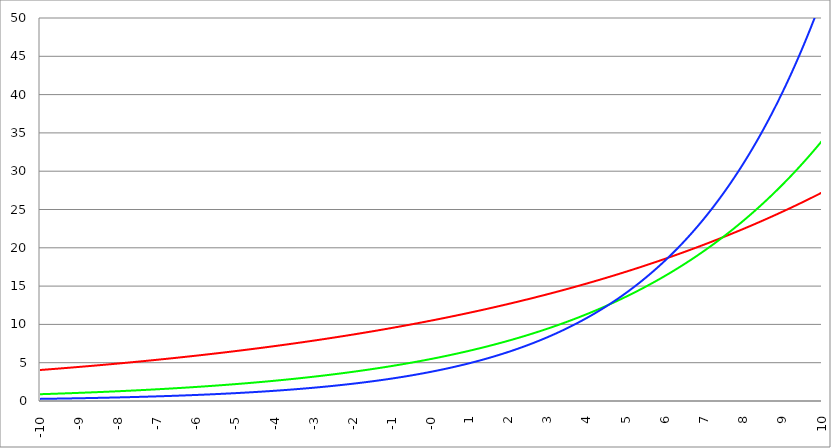
| Category | Series 1 | Series 0 | Series 2 |
|---|---|---|---|
| -10.0 | 4.045 | 0.886 | 0.276 |
| -9.99 | 4.049 | 0.887 | 0.277 |
| -9.98 | 4.053 | 0.889 | 0.278 |
| -9.97 | 4.057 | 0.891 | 0.279 |
| -9.96 | 4.061 | 0.892 | 0.279 |
| -9.95 | 4.064 | 0.894 | 0.28 |
| -9.940000000000001 | 4.068 | 0.896 | 0.281 |
| -9.930000000000001 | 4.072 | 0.897 | 0.282 |
| -9.920000000000002 | 4.076 | 0.899 | 0.282 |
| -9.91 | 4.08 | 0.9 | 0.283 |
| -9.900000000000002 | 4.084 | 0.902 | 0.284 |
| -9.890000000000002 | 4.088 | 0.904 | 0.285 |
| -9.880000000000003 | 4.092 | 0.905 | 0.285 |
| -9.870000000000003 | 4.096 | 0.907 | 0.286 |
| -9.860000000000001 | 4.099 | 0.909 | 0.287 |
| -9.850000000000003 | 4.103 | 0.91 | 0.288 |
| -9.840000000000003 | 4.107 | 0.912 | 0.288 |
| -9.830000000000004 | 4.111 | 0.914 | 0.289 |
| -9.820000000000004 | 4.115 | 0.915 | 0.29 |
| -9.810000000000004 | 4.119 | 0.917 | 0.291 |
| -9.800000000000004 | 4.123 | 0.919 | 0.291 |
| -9.790000000000004 | 4.127 | 0.92 | 0.292 |
| -9.780000000000005 | 4.131 | 0.922 | 0.293 |
| -9.770000000000005 | 4.135 | 0.924 | 0.294 |
| -9.760000000000005 | 4.139 | 0.925 | 0.294 |
| -9.750000000000005 | 4.143 | 0.927 | 0.295 |
| -9.740000000000006 | 4.147 | 0.929 | 0.296 |
| -9.730000000000006 | 4.151 | 0.931 | 0.297 |
| -9.720000000000006 | 4.155 | 0.932 | 0.298 |
| -9.710000000000006 | 4.159 | 0.934 | 0.298 |
| -9.700000000000006 | 4.162 | 0.936 | 0.299 |
| -9.690000000000007 | 4.166 | 0.937 | 0.3 |
| -9.680000000000007 | 4.17 | 0.939 | 0.301 |
| -9.670000000000007 | 4.174 | 0.941 | 0.301 |
| -9.660000000000007 | 4.178 | 0.942 | 0.302 |
| -9.650000000000007 | 4.182 | 0.944 | 0.303 |
| -9.640000000000008 | 4.186 | 0.946 | 0.304 |
| -9.630000000000008 | 4.19 | 0.948 | 0.305 |
| -9.620000000000008 | 4.194 | 0.949 | 0.305 |
| -9.610000000000008 | 4.198 | 0.951 | 0.306 |
| -9.600000000000009 | 4.202 | 0.953 | 0.307 |
| -9.590000000000009 | 4.206 | 0.955 | 0.308 |
| -9.580000000000007 | 4.21 | 0.956 | 0.309 |
| -9.57000000000001 | 4.214 | 0.958 | 0.309 |
| -9.56000000000001 | 4.218 | 0.96 | 0.31 |
| -9.55000000000001 | 4.222 | 0.962 | 0.311 |
| -9.54000000000001 | 4.226 | 0.963 | 0.312 |
| -9.53000000000001 | 4.23 | 0.965 | 0.313 |
| -9.52000000000001 | 4.235 | 0.967 | 0.314 |
| -9.51000000000001 | 4.239 | 0.969 | 0.314 |
| -9.50000000000001 | 4.243 | 0.97 | 0.315 |
| -9.49000000000001 | 4.247 | 0.972 | 0.316 |
| -9.48000000000001 | 4.251 | 0.974 | 0.317 |
| -9.47000000000001 | 4.255 | 0.976 | 0.318 |
| -9.46000000000001 | 4.259 | 0.977 | 0.319 |
| -9.45000000000001 | 4.263 | 0.979 | 0.319 |
| -9.44000000000001 | 4.267 | 0.981 | 0.32 |
| -9.430000000000012 | 4.271 | 0.983 | 0.321 |
| -9.420000000000012 | 4.275 | 0.985 | 0.322 |
| -9.410000000000013 | 4.279 | 0.986 | 0.323 |
| -9.400000000000013 | 4.283 | 0.988 | 0.324 |
| -9.390000000000011 | 4.287 | 0.99 | 0.324 |
| -9.380000000000013 | 4.291 | 0.992 | 0.325 |
| -9.370000000000013 | 4.295 | 0.994 | 0.326 |
| -9.360000000000014 | 4.3 | 0.995 | 0.327 |
| -9.350000000000014 | 4.304 | 0.997 | 0.328 |
| -9.340000000000014 | 4.308 | 0.999 | 0.329 |
| -9.330000000000014 | 4.312 | 1.001 | 0.33 |
| -9.320000000000014 | 4.316 | 1.003 | 0.33 |
| -9.310000000000015 | 4.32 | 1.005 | 0.331 |
| -9.300000000000013 | 4.324 | 1.006 | 0.332 |
| -9.290000000000015 | 4.328 | 1.008 | 0.333 |
| -9.280000000000015 | 4.332 | 1.01 | 0.334 |
| -9.270000000000016 | 4.337 | 1.012 | 0.335 |
| -9.260000000000016 | 4.341 | 1.014 | 0.336 |
| -9.250000000000014 | 4.345 | 1.016 | 0.337 |
| -9.240000000000016 | 4.349 | 1.017 | 0.337 |
| -9.230000000000016 | 4.353 | 1.019 | 0.338 |
| -9.220000000000017 | 4.357 | 1.021 | 0.339 |
| -9.210000000000017 | 4.361 | 1.023 | 0.34 |
| -9.200000000000017 | 4.366 | 1.025 | 0.341 |
| -9.190000000000017 | 4.37 | 1.027 | 0.342 |
| -9.180000000000017 | 4.374 | 1.029 | 0.343 |
| -9.170000000000018 | 4.378 | 1.031 | 0.344 |
| -9.160000000000016 | 4.382 | 1.032 | 0.345 |
| -9.150000000000018 | 4.386 | 1.034 | 0.346 |
| -9.140000000000018 | 4.391 | 1.036 | 0.346 |
| -9.130000000000019 | 4.395 | 1.038 | 0.347 |
| -9.120000000000019 | 4.399 | 1.04 | 0.348 |
| -9.110000000000017 | 4.403 | 1.042 | 0.349 |
| -9.10000000000002 | 4.407 | 1.044 | 0.35 |
| -9.09000000000002 | 4.412 | 1.046 | 0.351 |
| -9.08000000000002 | 4.416 | 1.048 | 0.352 |
| -9.07000000000002 | 4.42 | 1.05 | 0.353 |
| -9.06000000000002 | 4.424 | 1.051 | 0.354 |
| -9.05000000000002 | 4.429 | 1.053 | 0.355 |
| -9.04000000000002 | 4.433 | 1.055 | 0.356 |
| -9.03000000000002 | 4.437 | 1.057 | 0.357 |
| -9.020000000000021 | 4.441 | 1.059 | 0.358 |
| -9.010000000000021 | 4.445 | 1.061 | 0.358 |
| -9.000000000000021 | 4.45 | 1.063 | 0.359 |
| -8.990000000000022 | 4.454 | 1.065 | 0.36 |
| -8.980000000000022 | 4.458 | 1.067 | 0.361 |
| -8.97000000000002 | 4.462 | 1.069 | 0.362 |
| -8.960000000000022 | 4.467 | 1.071 | 0.363 |
| -8.950000000000022 | 4.471 | 1.073 | 0.364 |
| -8.940000000000023 | 4.475 | 1.075 | 0.365 |
| -8.930000000000023 | 4.479 | 1.077 | 0.366 |
| -8.920000000000023 | 4.484 | 1.079 | 0.367 |
| -8.910000000000023 | 4.488 | 1.081 | 0.368 |
| -8.900000000000023 | 4.492 | 1.083 | 0.369 |
| -8.890000000000024 | 4.497 | 1.085 | 0.37 |
| -8.880000000000024 | 4.501 | 1.087 | 0.371 |
| -8.870000000000024 | 4.505 | 1.088 | 0.372 |
| -8.860000000000024 | 4.509 | 1.09 | 0.373 |
| -8.850000000000025 | 4.514 | 1.092 | 0.374 |
| -8.840000000000025 | 4.518 | 1.094 | 0.375 |
| -8.830000000000025 | 4.522 | 1.096 | 0.376 |
| -8.820000000000025 | 4.527 | 1.098 | 0.377 |
| -8.810000000000025 | 4.531 | 1.1 | 0.378 |
| -8.800000000000026 | 4.535 | 1.102 | 0.379 |
| -8.790000000000026 | 4.54 | 1.104 | 0.38 |
| -8.780000000000026 | 4.544 | 1.106 | 0.381 |
| -8.770000000000026 | 4.548 | 1.109 | 0.382 |
| -8.760000000000026 | 4.553 | 1.111 | 0.383 |
| -8.750000000000027 | 4.557 | 1.113 | 0.384 |
| -8.740000000000027 | 4.561 | 1.115 | 0.385 |
| -8.730000000000027 | 4.566 | 1.117 | 0.386 |
| -8.720000000000027 | 4.57 | 1.119 | 0.387 |
| -8.710000000000027 | 4.574 | 1.121 | 0.388 |
| -8.700000000000028 | 4.579 | 1.123 | 0.389 |
| -8.690000000000028 | 4.583 | 1.125 | 0.39 |
| -8.680000000000028 | 4.587 | 1.127 | 0.391 |
| -8.670000000000028 | 4.592 | 1.129 | 0.392 |
| -8.660000000000029 | 4.596 | 1.131 | 0.393 |
| -8.650000000000029 | 4.601 | 1.133 | 0.394 |
| -8.640000000000029 | 4.605 | 1.135 | 0.395 |
| -8.63000000000003 | 4.609 | 1.137 | 0.396 |
| -8.62000000000003 | 4.614 | 1.139 | 0.397 |
| -8.61000000000003 | 4.618 | 1.141 | 0.398 |
| -8.60000000000003 | 4.623 | 1.143 | 0.399 |
| -8.59000000000003 | 4.627 | 1.145 | 0.4 |
| -8.58000000000003 | 4.631 | 1.148 | 0.401 |
| -8.57000000000003 | 4.636 | 1.15 | 0.402 |
| -8.56000000000003 | 4.64 | 1.152 | 0.403 |
| -8.55000000000003 | 4.645 | 1.154 | 0.404 |
| -8.540000000000031 | 4.649 | 1.156 | 0.406 |
| -8.530000000000031 | 4.654 | 1.158 | 0.407 |
| -8.520000000000032 | 4.658 | 1.16 | 0.408 |
| -8.510000000000032 | 4.662 | 1.162 | 0.409 |
| -8.50000000000003 | 4.667 | 1.164 | 0.41 |
| -8.490000000000032 | 4.671 | 1.167 | 0.411 |
| -8.480000000000032 | 4.676 | 1.169 | 0.412 |
| -8.470000000000033 | 4.68 | 1.171 | 0.413 |
| -8.460000000000033 | 4.685 | 1.173 | 0.414 |
| -8.450000000000033 | 4.689 | 1.175 | 0.415 |
| -8.440000000000033 | 4.694 | 1.177 | 0.416 |
| -8.430000000000033 | 4.698 | 1.179 | 0.417 |
| -8.420000000000034 | 4.703 | 1.182 | 0.418 |
| -8.410000000000032 | 4.707 | 1.184 | 0.42 |
| -8.400000000000034 | 4.712 | 1.186 | 0.421 |
| -8.390000000000034 | 4.716 | 1.188 | 0.422 |
| -8.380000000000035 | 4.721 | 1.19 | 0.423 |
| -8.370000000000035 | 4.725 | 1.192 | 0.424 |
| -8.360000000000033 | 4.73 | 1.195 | 0.425 |
| -8.350000000000035 | 4.734 | 1.197 | 0.426 |
| -8.340000000000035 | 4.739 | 1.199 | 0.427 |
| -8.330000000000036 | 4.743 | 1.201 | 0.428 |
| -8.320000000000036 | 4.748 | 1.203 | 0.43 |
| -8.310000000000034 | 4.752 | 1.205 | 0.431 |
| -8.300000000000036 | 4.757 | 1.208 | 0.432 |
| -8.290000000000036 | 4.761 | 1.21 | 0.433 |
| -8.280000000000037 | 4.766 | 1.212 | 0.434 |
| -8.270000000000037 | 4.77 | 1.214 | 0.435 |
| -8.260000000000037 | 4.775 | 1.217 | 0.436 |
| -8.250000000000037 | 4.779 | 1.219 | 0.438 |
| -8.240000000000038 | 4.784 | 1.221 | 0.439 |
| -8.230000000000038 | 4.788 | 1.223 | 0.44 |
| -8.220000000000038 | 4.793 | 1.225 | 0.441 |
| -8.210000000000038 | 4.798 | 1.228 | 0.442 |
| -8.200000000000038 | 4.802 | 1.23 | 0.443 |
| -8.190000000000039 | 4.807 | 1.232 | 0.445 |
| -8.180000000000039 | 4.811 | 1.234 | 0.446 |
| -8.170000000000037 | 4.816 | 1.237 | 0.447 |
| -8.16000000000004 | 4.821 | 1.239 | 0.448 |
| -8.15000000000004 | 4.825 | 1.241 | 0.449 |
| -8.14000000000004 | 4.83 | 1.243 | 0.45 |
| -8.13000000000004 | 4.834 | 1.246 | 0.452 |
| -8.12000000000004 | 4.839 | 1.248 | 0.453 |
| -8.11000000000004 | 4.844 | 1.25 | 0.454 |
| -8.10000000000004 | 4.848 | 1.253 | 0.455 |
| -8.09000000000004 | 4.853 | 1.255 | 0.456 |
| -8.08000000000004 | 4.857 | 1.257 | 0.458 |
| -8.07000000000004 | 4.862 | 1.259 | 0.459 |
| -8.06000000000004 | 4.867 | 1.262 | 0.46 |
| -8.05000000000004 | 4.871 | 1.264 | 0.461 |
| -8.040000000000042 | 4.876 | 1.266 | 0.462 |
| -8.03000000000004 | 4.881 | 1.269 | 0.464 |
| -8.020000000000042 | 4.885 | 1.271 | 0.465 |
| -8.010000000000042 | 4.89 | 1.273 | 0.466 |
| -8.000000000000043 | 4.895 | 1.276 | 0.467 |
| -7.990000000000043 | 4.899 | 1.278 | 0.468 |
| -7.980000000000043 | 4.904 | 1.28 | 0.47 |
| -7.970000000000043 | 4.909 | 1.283 | 0.471 |
| -7.960000000000043 | 4.913 | 1.285 | 0.472 |
| -7.950000000000044 | 4.918 | 1.287 | 0.473 |
| -7.940000000000044 | 4.923 | 1.29 | 0.475 |
| -7.930000000000044 | 4.927 | 1.292 | 0.476 |
| -7.920000000000044 | 4.932 | 1.294 | 0.477 |
| -7.910000000000044 | 4.937 | 1.297 | 0.478 |
| -7.900000000000044 | 4.941 | 1.299 | 0.48 |
| -7.890000000000045 | 4.946 | 1.301 | 0.481 |
| -7.880000000000045 | 4.951 | 1.304 | 0.482 |
| -7.870000000000045 | 4.956 | 1.306 | 0.483 |
| -7.860000000000046 | 4.96 | 1.309 | 0.485 |
| -7.850000000000046 | 4.965 | 1.311 | 0.486 |
| -7.840000000000046 | 4.97 | 1.313 | 0.487 |
| -7.830000000000046 | 4.975 | 1.316 | 0.489 |
| -7.820000000000046 | 4.979 | 1.318 | 0.49 |
| -7.810000000000047 | 4.984 | 1.321 | 0.491 |
| -7.800000000000047 | 4.989 | 1.323 | 0.492 |
| -7.790000000000047 | 4.994 | 1.325 | 0.494 |
| -7.780000000000047 | 4.998 | 1.328 | 0.495 |
| -7.770000000000047 | 5.003 | 1.33 | 0.496 |
| -7.760000000000048 | 5.008 | 1.333 | 0.498 |
| -7.750000000000048 | 5.013 | 1.335 | 0.499 |
| -7.740000000000048 | 5.017 | 1.338 | 0.5 |
| -7.730000000000048 | 5.022 | 1.34 | 0.502 |
| -7.720000000000049 | 5.027 | 1.342 | 0.503 |
| -7.710000000000049 | 5.032 | 1.345 | 0.504 |
| -7.700000000000049 | 5.037 | 1.347 | 0.506 |
| -7.690000000000049 | 5.041 | 1.35 | 0.507 |
| -7.680000000000049 | 5.046 | 1.352 | 0.508 |
| -7.67000000000005 | 5.051 | 1.355 | 0.51 |
| -7.66000000000005 | 5.056 | 1.357 | 0.511 |
| -7.65000000000005 | 5.061 | 1.36 | 0.512 |
| -7.64000000000005 | 5.065 | 1.362 | 0.514 |
| -7.63000000000005 | 5.07 | 1.365 | 0.515 |
| -7.620000000000051 | 5.075 | 1.367 | 0.516 |
| -7.610000000000051 | 5.08 | 1.37 | 0.518 |
| -7.600000000000051 | 5.085 | 1.372 | 0.519 |
| -7.590000000000051 | 5.09 | 1.375 | 0.52 |
| -7.580000000000052 | 5.095 | 1.377 | 0.522 |
| -7.570000000000052 | 5.099 | 1.38 | 0.523 |
| -7.560000000000052 | 5.104 | 1.382 | 0.524 |
| -7.550000000000052 | 5.109 | 1.385 | 0.526 |
| -7.540000000000052 | 5.114 | 1.387 | 0.527 |
| -7.530000000000053 | 5.119 | 1.39 | 0.529 |
| -7.520000000000053 | 5.124 | 1.392 | 0.53 |
| -7.510000000000053 | 5.129 | 1.395 | 0.531 |
| -7.500000000000053 | 5.134 | 1.397 | 0.533 |
| -7.490000000000053 | 5.138 | 1.4 | 0.534 |
| -7.480000000000054 | 5.143 | 1.402 | 0.536 |
| -7.470000000000054 | 5.148 | 1.405 | 0.537 |
| -7.460000000000054 | 5.153 | 1.408 | 0.538 |
| -7.450000000000054 | 5.158 | 1.41 | 0.54 |
| -7.440000000000054 | 5.163 | 1.413 | 0.541 |
| -7.430000000000054 | 5.168 | 1.415 | 0.543 |
| -7.420000000000055 | 5.173 | 1.418 | 0.544 |
| -7.410000000000055 | 5.178 | 1.42 | 0.545 |
| -7.400000000000055 | 5.183 | 1.423 | 0.547 |
| -7.390000000000056 | 5.188 | 1.426 | 0.548 |
| -7.380000000000056 | 5.193 | 1.428 | 0.55 |
| -7.370000000000056 | 5.198 | 1.431 | 0.551 |
| -7.360000000000056 | 5.202 | 1.433 | 0.553 |
| -7.350000000000056 | 5.207 | 1.436 | 0.554 |
| -7.340000000000057 | 5.212 | 1.439 | 0.556 |
| -7.330000000000057 | 5.217 | 1.441 | 0.557 |
| -7.320000000000057 | 5.222 | 1.444 | 0.559 |
| -7.310000000000057 | 5.227 | 1.447 | 0.56 |
| -7.300000000000058 | 5.232 | 1.449 | 0.561 |
| -7.290000000000058 | 5.237 | 1.452 | 0.563 |
| -7.280000000000058 | 5.242 | 1.455 | 0.564 |
| -7.270000000000058 | 5.247 | 1.457 | 0.566 |
| -7.260000000000058 | 5.252 | 1.46 | 0.567 |
| -7.250000000000059 | 5.257 | 1.463 | 0.569 |
| -7.240000000000059 | 5.262 | 1.465 | 0.57 |
| -7.23000000000006 | 5.267 | 1.468 | 0.572 |
| -7.220000000000059 | 5.272 | 1.471 | 0.573 |
| -7.210000000000059 | 5.277 | 1.473 | 0.575 |
| -7.20000000000006 | 5.282 | 1.476 | 0.576 |
| -7.19000000000006 | 5.287 | 1.479 | 0.578 |
| -7.18000000000006 | 5.293 | 1.481 | 0.579 |
| -7.17000000000006 | 5.298 | 1.484 | 0.581 |
| -7.160000000000061 | 5.303 | 1.487 | 0.582 |
| -7.150000000000061 | 5.308 | 1.489 | 0.584 |
| -7.140000000000061 | 5.313 | 1.492 | 0.586 |
| -7.130000000000061 | 5.318 | 1.495 | 0.587 |
| -7.120000000000061 | 5.323 | 1.498 | 0.589 |
| -7.110000000000062 | 5.328 | 1.5 | 0.59 |
| -7.100000000000062 | 5.333 | 1.503 | 0.592 |
| -7.090000000000062 | 5.338 | 1.506 | 0.593 |
| -7.080000000000062 | 5.343 | 1.509 | 0.595 |
| -7.070000000000062 | 5.348 | 1.511 | 0.596 |
| -7.060000000000063 | 5.353 | 1.514 | 0.598 |
| -7.050000000000063 | 5.358 | 1.517 | 0.6 |
| -7.040000000000063 | 5.364 | 1.52 | 0.601 |
| -7.030000000000063 | 5.369 | 1.522 | 0.603 |
| -7.020000000000064 | 5.374 | 1.525 | 0.604 |
| -7.010000000000064 | 5.379 | 1.528 | 0.606 |
| -7.000000000000064 | 5.384 | 1.531 | 0.607 |
| -6.990000000000064 | 5.389 | 1.534 | 0.609 |
| -6.980000000000064 | 5.394 | 1.536 | 0.611 |
| -6.970000000000064 | 5.4 | 1.539 | 0.612 |
| -6.960000000000064 | 5.405 | 1.542 | 0.614 |
| -6.950000000000064 | 5.41 | 1.545 | 0.615 |
| -6.940000000000065 | 5.415 | 1.548 | 0.617 |
| -6.930000000000065 | 5.42 | 1.55 | 0.619 |
| -6.920000000000065 | 5.425 | 1.553 | 0.62 |
| -6.910000000000065 | 5.43 | 1.556 | 0.622 |
| -6.900000000000066 | 5.436 | 1.559 | 0.624 |
| -6.890000000000066 | 5.441 | 1.562 | 0.625 |
| -6.880000000000066 | 5.446 | 1.565 | 0.627 |
| -6.870000000000066 | 5.451 | 1.567 | 0.628 |
| -6.860000000000067 | 5.456 | 1.57 | 0.63 |
| -6.850000000000067 | 5.462 | 1.573 | 0.632 |
| -6.840000000000067 | 5.467 | 1.576 | 0.633 |
| -6.830000000000067 | 5.472 | 1.579 | 0.635 |
| -6.820000000000068 | 5.477 | 1.582 | 0.637 |
| -6.810000000000068 | 5.482 | 1.585 | 0.638 |
| -6.800000000000068 | 5.488 | 1.588 | 0.64 |
| -6.790000000000068 | 5.493 | 1.59 | 0.642 |
| -6.780000000000068 | 5.498 | 1.593 | 0.644 |
| -6.770000000000068 | 5.503 | 1.596 | 0.645 |
| -6.760000000000069 | 5.509 | 1.599 | 0.647 |
| -6.75000000000007 | 5.514 | 1.602 | 0.649 |
| -6.74000000000007 | 5.519 | 1.605 | 0.65 |
| -6.73000000000007 | 5.524 | 1.608 | 0.652 |
| -6.72000000000007 | 5.53 | 1.611 | 0.654 |
| -6.71000000000007 | 5.535 | 1.614 | 0.655 |
| -6.70000000000007 | 5.54 | 1.617 | 0.657 |
| -6.69000000000007 | 5.546 | 1.62 | 0.659 |
| -6.680000000000071 | 5.551 | 1.623 | 0.661 |
| -6.670000000000071 | 5.556 | 1.626 | 0.662 |
| -6.660000000000071 | 5.561 | 1.629 | 0.664 |
| -6.650000000000071 | 5.567 | 1.632 | 0.666 |
| -6.640000000000072 | 5.572 | 1.635 | 0.668 |
| -6.630000000000072 | 5.577 | 1.638 | 0.669 |
| -6.620000000000072 | 5.583 | 1.641 | 0.671 |
| -6.610000000000072 | 5.588 | 1.644 | 0.673 |
| -6.600000000000072 | 5.593 | 1.647 | 0.675 |
| -6.590000000000073 | 5.599 | 1.65 | 0.676 |
| -6.580000000000073 | 5.604 | 1.653 | 0.678 |
| -6.570000000000073 | 5.609 | 1.656 | 0.68 |
| -6.560000000000073 | 5.615 | 1.659 | 0.682 |
| -6.550000000000074 | 5.62 | 1.662 | 0.684 |
| -6.540000000000074 | 5.625 | 1.665 | 0.685 |
| -6.530000000000074 | 5.631 | 1.668 | 0.687 |
| -6.520000000000074 | 5.636 | 1.671 | 0.689 |
| -6.510000000000074 | 5.641 | 1.674 | 0.691 |
| -6.500000000000074 | 5.647 | 1.677 | 0.693 |
| -6.490000000000074 | 5.652 | 1.68 | 0.694 |
| -6.480000000000074 | 5.658 | 1.683 | 0.696 |
| -6.470000000000075 | 5.663 | 1.686 | 0.698 |
| -6.460000000000075 | 5.668 | 1.689 | 0.7 |
| -6.450000000000075 | 5.674 | 1.692 | 0.702 |
| -6.440000000000075 | 5.679 | 1.695 | 0.704 |
| -6.430000000000076 | 5.685 | 1.698 | 0.705 |
| -6.420000000000076 | 5.69 | 1.701 | 0.707 |
| -6.410000000000076 | 5.696 | 1.705 | 0.709 |
| -6.400000000000076 | 5.701 | 1.708 | 0.711 |
| -6.390000000000077 | 5.706 | 1.711 | 0.713 |
| -6.380000000000077 | 5.712 | 1.714 | 0.715 |
| -6.370000000000077 | 5.717 | 1.717 | 0.717 |
| -6.360000000000078 | 5.723 | 1.72 | 0.718 |
| -6.350000000000078 | 5.728 | 1.723 | 0.72 |
| -6.340000000000078 | 5.734 | 1.726 | 0.722 |
| -6.330000000000078 | 5.739 | 1.73 | 0.724 |
| -6.320000000000078 | 5.745 | 1.733 | 0.726 |
| -6.310000000000079 | 5.75 | 1.736 | 0.728 |
| -6.300000000000079 | 5.756 | 1.739 | 0.73 |
| -6.29000000000008 | 5.761 | 1.742 | 0.732 |
| -6.28000000000008 | 5.767 | 1.745 | 0.734 |
| -6.27000000000008 | 5.772 | 1.749 | 0.736 |
| -6.26000000000008 | 5.778 | 1.752 | 0.738 |
| -6.25000000000008 | 5.783 | 1.755 | 0.74 |
| -6.24000000000008 | 5.789 | 1.758 | 0.741 |
| -6.23000000000008 | 5.794 | 1.761 | 0.743 |
| -6.220000000000081 | 5.8 | 1.765 | 0.745 |
| -6.210000000000081 | 5.805 | 1.768 | 0.747 |
| -6.200000000000081 | 5.811 | 1.771 | 0.749 |
| -6.190000000000081 | 5.816 | 1.774 | 0.751 |
| -6.180000000000081 | 5.822 | 1.778 | 0.753 |
| -6.170000000000082 | 5.827 | 1.781 | 0.755 |
| -6.160000000000082 | 5.833 | 1.784 | 0.757 |
| -6.150000000000082 | 5.838 | 1.787 | 0.759 |
| -6.140000000000082 | 5.844 | 1.791 | 0.761 |
| -6.130000000000082 | 5.85 | 1.794 | 0.763 |
| -6.120000000000083 | 5.855 | 1.797 | 0.765 |
| -6.110000000000083 | 5.861 | 1.8 | 0.767 |
| -6.100000000000083 | 5.866 | 1.804 | 0.769 |
| -6.090000000000083 | 5.872 | 1.807 | 0.771 |
| -6.080000000000084 | 5.878 | 1.81 | 0.773 |
| -6.070000000000084 | 5.883 | 1.814 | 0.775 |
| -6.060000000000084 | 5.889 | 1.817 | 0.777 |
| -6.050000000000084 | 5.894 | 1.82 | 0.779 |
| -6.040000000000084 | 5.9 | 1.824 | 0.781 |
| -6.030000000000084 | 5.906 | 1.827 | 0.783 |
| -6.020000000000085 | 5.911 | 1.83 | 0.786 |
| -6.010000000000085 | 5.917 | 1.834 | 0.788 |
| -6.000000000000085 | 5.922 | 1.837 | 0.79 |
| -5.990000000000085 | 5.928 | 1.84 | 0.792 |
| -5.980000000000085 | 5.934 | 1.844 | 0.794 |
| -5.970000000000085 | 5.939 | 1.847 | 0.796 |
| -5.960000000000086 | 5.945 | 1.85 | 0.798 |
| -5.950000000000086 | 5.951 | 1.854 | 0.8 |
| -5.940000000000086 | 5.956 | 1.857 | 0.802 |
| -5.930000000000086 | 5.962 | 1.86 | 0.804 |
| -5.920000000000087 | 5.968 | 1.864 | 0.806 |
| -5.910000000000087 | 5.974 | 1.867 | 0.809 |
| -5.900000000000087 | 5.979 | 1.871 | 0.811 |
| -5.890000000000088 | 5.985 | 1.874 | 0.813 |
| -5.880000000000088 | 5.991 | 1.877 | 0.815 |
| -5.870000000000088 | 5.996 | 1.881 | 0.817 |
| -5.860000000000088 | 6.002 | 1.884 | 0.819 |
| -5.850000000000088 | 6.008 | 1.888 | 0.821 |
| -5.840000000000089 | 6.014 | 1.891 | 0.824 |
| -5.830000000000089 | 6.019 | 1.895 | 0.826 |
| -5.820000000000089 | 6.025 | 1.898 | 0.828 |
| -5.810000000000089 | 6.031 | 1.902 | 0.83 |
| -5.800000000000089 | 6.036 | 1.905 | 0.832 |
| -5.79000000000009 | 6.042 | 1.909 | 0.834 |
| -5.78000000000009 | 6.048 | 1.912 | 0.837 |
| -5.77000000000009 | 6.054 | 1.916 | 0.839 |
| -5.76000000000009 | 6.06 | 1.919 | 0.841 |
| -5.750000000000091 | 6.065 | 1.923 | 0.843 |
| -5.740000000000091 | 6.071 | 1.926 | 0.845 |
| -5.730000000000091 | 6.077 | 1.93 | 0.848 |
| -5.720000000000091 | 6.083 | 1.933 | 0.85 |
| -5.710000000000091 | 6.088 | 1.937 | 0.852 |
| -5.700000000000092 | 6.094 | 1.94 | 0.854 |
| -5.690000000000092 | 6.1 | 1.944 | 0.857 |
| -5.680000000000092 | 6.106 | 1.947 | 0.859 |
| -5.670000000000092 | 6.112 | 1.951 | 0.861 |
| -5.660000000000092 | 6.118 | 1.954 | 0.863 |
| -5.650000000000093 | 6.123 | 1.958 | 0.866 |
| -5.640000000000093 | 6.129 | 1.961 | 0.868 |
| -5.630000000000093 | 6.135 | 1.965 | 0.87 |
| -5.620000000000093 | 6.141 | 1.969 | 0.872 |
| -5.610000000000093 | 6.147 | 1.972 | 0.875 |
| -5.600000000000094 | 6.153 | 1.976 | 0.877 |
| -5.590000000000094 | 6.159 | 1.979 | 0.879 |
| -5.580000000000094 | 6.164 | 1.983 | 0.882 |
| -5.570000000000094 | 6.17 | 1.987 | 0.884 |
| -5.560000000000095 | 6.176 | 1.99 | 0.886 |
| -5.550000000000095 | 6.182 | 1.994 | 0.889 |
| -5.540000000000095 | 6.188 | 1.998 | 0.891 |
| -5.530000000000095 | 6.194 | 2.001 | 0.893 |
| -5.520000000000095 | 6.2 | 2.005 | 0.896 |
| -5.510000000000096 | 6.206 | 2.009 | 0.898 |
| -5.500000000000096 | 6.212 | 2.012 | 0.9 |
| -5.490000000000096 | 6.217 | 2.016 | 0.903 |
| -5.480000000000096 | 6.223 | 2.02 | 0.905 |
| -5.470000000000096 | 6.229 | 2.023 | 0.907 |
| -5.460000000000097 | 6.235 | 2.027 | 0.91 |
| -5.450000000000097 | 6.241 | 2.031 | 0.912 |
| -5.440000000000097 | 6.247 | 2.034 | 0.915 |
| -5.430000000000097 | 6.253 | 2.038 | 0.917 |
| -5.420000000000098 | 6.259 | 2.042 | 0.919 |
| -5.410000000000098 | 6.265 | 2.045 | 0.922 |
| -5.400000000000098 | 6.271 | 2.049 | 0.924 |
| -5.390000000000098 | 6.277 | 2.053 | 0.927 |
| -5.380000000000098 | 6.283 | 2.057 | 0.929 |
| -5.370000000000099 | 6.289 | 2.06 | 0.932 |
| -5.360000000000099 | 6.295 | 2.064 | 0.934 |
| -5.350000000000099 | 6.301 | 2.068 | 0.936 |
| -5.340000000000099 | 6.307 | 2.072 | 0.939 |
| -5.330000000000099 | 6.313 | 2.076 | 0.941 |
| -5.3200000000001 | 6.319 | 2.079 | 0.944 |
| -5.3100000000001 | 6.325 | 2.083 | 0.946 |
| -5.3000000000001 | 6.331 | 2.087 | 0.949 |
| -5.2900000000001 | 6.337 | 2.091 | 0.951 |
| -5.2800000000001 | 6.343 | 2.095 | 0.954 |
| -5.2700000000001 | 6.349 | 2.098 | 0.956 |
| -5.260000000000101 | 6.355 | 2.102 | 0.959 |
| -5.250000000000101 | 6.361 | 2.106 | 0.961 |
| -5.240000000000101 | 6.367 | 2.11 | 0.964 |
| -5.230000000000101 | 6.373 | 2.114 | 0.966 |
| -5.220000000000102 | 6.38 | 2.118 | 0.969 |
| -5.210000000000102 | 6.386 | 2.121 | 0.972 |
| -5.200000000000102 | 6.392 | 2.125 | 0.974 |
| -5.190000000000103 | 6.398 | 2.129 | 0.977 |
| -5.180000000000103 | 6.404 | 2.133 | 0.979 |
| -5.170000000000103 | 6.41 | 2.137 | 0.982 |
| -5.160000000000103 | 6.416 | 2.141 | 0.984 |
| -5.150000000000103 | 6.422 | 2.145 | 0.987 |
| -5.140000000000104 | 6.428 | 2.149 | 0.99 |
| -5.130000000000104 | 6.435 | 2.153 | 0.992 |
| -5.120000000000104 | 6.441 | 2.157 | 0.995 |
| -5.110000000000104 | 6.447 | 2.16 | 0.997 |
| -5.100000000000104 | 6.453 | 2.164 | 1 |
| -5.090000000000104 | 6.459 | 2.168 | 1.003 |
| -5.080000000000104 | 6.465 | 2.172 | 1.005 |
| -5.070000000000105 | 6.471 | 2.176 | 1.008 |
| -5.060000000000105 | 6.478 | 2.18 | 1.011 |
| -5.050000000000105 | 6.484 | 2.184 | 1.013 |
| -5.040000000000105 | 6.49 | 2.188 | 1.016 |
| -5.030000000000105 | 6.496 | 2.192 | 1.018 |
| -5.020000000000106 | 6.502 | 2.196 | 1.021 |
| -5.010000000000106 | 6.509 | 2.2 | 1.024 |
| -5.000000000000106 | 6.515 | 2.204 | 1.027 |
| -4.990000000000106 | 6.521 | 2.208 | 1.029 |
| -4.980000000000106 | 6.527 | 2.212 | 1.032 |
| -4.970000000000107 | 6.533 | 2.216 | 1.035 |
| -4.960000000000107 | 6.54 | 2.22 | 1.037 |
| -4.950000000000107 | 6.546 | 2.224 | 1.04 |
| -4.940000000000107 | 6.552 | 2.228 | 1.043 |
| -4.930000000000108 | 6.558 | 2.233 | 1.046 |
| -4.920000000000108 | 6.565 | 2.237 | 1.048 |
| -4.910000000000108 | 6.571 | 2.241 | 1.051 |
| -4.900000000000108 | 6.577 | 2.245 | 1.054 |
| -4.890000000000109 | 6.583 | 2.249 | 1.057 |
| -4.88000000000011 | 6.59 | 2.253 | 1.059 |
| -4.87000000000011 | 6.596 | 2.257 | 1.062 |
| -4.86000000000011 | 6.602 | 2.261 | 1.065 |
| -4.85000000000011 | 6.609 | 2.265 | 1.068 |
| -4.84000000000011 | 6.615 | 2.269 | 1.071 |
| -4.83000000000011 | 6.621 | 2.274 | 1.073 |
| -4.82000000000011 | 6.627 | 2.278 | 1.076 |
| -4.810000000000111 | 6.634 | 2.282 | 1.079 |
| -4.800000000000111 | 6.64 | 2.286 | 1.082 |
| -4.790000000000111 | 6.646 | 2.29 | 1.085 |
| -4.780000000000111 | 6.653 | 2.294 | 1.088 |
| -4.770000000000111 | 6.659 | 2.299 | 1.09 |
| -4.760000000000112 | 6.665 | 2.303 | 1.093 |
| -4.750000000000112 | 6.672 | 2.307 | 1.096 |
| -4.740000000000112 | 6.678 | 2.311 | 1.099 |
| -4.730000000000112 | 6.685 | 2.315 | 1.102 |
| -4.720000000000112 | 6.691 | 2.32 | 1.105 |
| -4.710000000000113 | 6.697 | 2.324 | 1.108 |
| -4.700000000000113 | 6.704 | 2.328 | 1.111 |
| -4.690000000000113 | 6.71 | 2.332 | 1.114 |
| -4.680000000000113 | 6.716 | 2.337 | 1.116 |
| -4.670000000000114 | 6.723 | 2.341 | 1.119 |
| -4.660000000000114 | 6.729 | 2.345 | 1.122 |
| -4.650000000000114 | 6.736 | 2.349 | 1.125 |
| -4.640000000000114 | 6.742 | 2.354 | 1.128 |
| -4.630000000000114 | 6.749 | 2.358 | 1.131 |
| -4.620000000000115 | 6.755 | 2.362 | 1.134 |
| -4.610000000000115 | 6.761 | 2.367 | 1.137 |
| -4.600000000000115 | 6.768 | 2.371 | 1.14 |
| -4.590000000000115 | 6.774 | 2.375 | 1.143 |
| -4.580000000000115 | 6.781 | 2.38 | 1.146 |
| -4.570000000000115 | 6.787 | 2.384 | 1.149 |
| -4.560000000000116 | 6.794 | 2.388 | 1.152 |
| -4.550000000000116 | 6.8 | 2.393 | 1.155 |
| -4.540000000000116 | 6.807 | 2.397 | 1.158 |
| -4.530000000000116 | 6.813 | 2.401 | 1.161 |
| -4.520000000000117 | 6.82 | 2.406 | 1.164 |
| -4.510000000000117 | 6.826 | 2.41 | 1.167 |
| -4.500000000000117 | 6.833 | 2.415 | 1.17 |
| -4.490000000000117 | 6.839 | 2.419 | 1.174 |
| -4.480000000000117 | 6.846 | 2.423 | 1.177 |
| -4.470000000000117 | 6.852 | 2.428 | 1.18 |
| -4.460000000000118 | 6.859 | 2.432 | 1.183 |
| -4.450000000000118 | 6.865 | 2.437 | 1.186 |
| -4.440000000000118 | 6.872 | 2.441 | 1.189 |
| -4.430000000000118 | 6.878 | 2.446 | 1.192 |
| -4.420000000000119 | 6.885 | 2.45 | 1.195 |
| -4.41000000000012 | 6.892 | 2.455 | 1.198 |
| -4.40000000000012 | 6.898 | 2.459 | 1.202 |
| -4.39000000000012 | 6.905 | 2.464 | 1.205 |
| -4.38000000000012 | 6.911 | 2.468 | 1.208 |
| -4.37000000000012 | 6.918 | 2.473 | 1.211 |
| -4.36000000000012 | 6.925 | 2.477 | 1.214 |
| -4.35000000000012 | 6.931 | 2.482 | 1.217 |
| -4.34000000000012 | 6.938 | 2.486 | 1.221 |
| -4.33000000000012 | 6.944 | 2.491 | 1.224 |
| -4.320000000000121 | 6.951 | 2.495 | 1.227 |
| -4.310000000000121 | 6.958 | 2.5 | 1.23 |
| -4.300000000000121 | 6.964 | 2.504 | 1.233 |
| -4.290000000000121 | 6.971 | 2.509 | 1.237 |
| -4.280000000000121 | 6.978 | 2.513 | 1.24 |
| -4.270000000000122 | 6.984 | 2.518 | 1.243 |
| -4.260000000000122 | 6.991 | 2.523 | 1.247 |
| -4.250000000000122 | 6.997 | 2.527 | 1.25 |
| -4.240000000000122 | 7.004 | 2.532 | 1.253 |
| -4.230000000000122 | 7.011 | 2.536 | 1.256 |
| -4.220000000000123 | 7.018 | 2.541 | 1.26 |
| -4.210000000000123 | 7.024 | 2.546 | 1.263 |
| -4.200000000000123 | 7.031 | 2.55 | 1.266 |
| -4.190000000000124 | 7.038 | 2.555 | 1.27 |
| -4.180000000000124 | 7.044 | 2.56 | 1.273 |
| -4.170000000000124 | 7.051 | 2.564 | 1.276 |
| -4.160000000000124 | 7.058 | 2.569 | 1.28 |
| -4.150000000000124 | 7.064 | 2.574 | 1.283 |
| -4.140000000000124 | 7.071 | 2.578 | 1.286 |
| -4.130000000000125 | 7.078 | 2.583 | 1.29 |
| -4.120000000000125 | 7.085 | 2.588 | 1.293 |
| -4.110000000000125 | 7.091 | 2.593 | 1.297 |
| -4.100000000000125 | 7.098 | 2.597 | 1.3 |
| -4.090000000000125 | 7.105 | 2.602 | 1.303 |
| -4.080000000000126 | 7.112 | 2.607 | 1.307 |
| -4.070000000000126 | 7.119 | 2.612 | 1.31 |
| -4.060000000000126 | 7.125 | 2.616 | 1.314 |
| -4.050000000000126 | 7.132 | 2.621 | 1.317 |
| -4.040000000000127 | 7.139 | 2.626 | 1.321 |
| -4.030000000000127 | 7.146 | 2.631 | 1.324 |
| -4.020000000000127 | 7.153 | 2.635 | 1.328 |
| -4.010000000000127 | 7.159 | 2.64 | 1.331 |
| -4.000000000000127 | 7.166 | 2.645 | 1.335 |
| -3.990000000000128 | 7.173 | 2.65 | 1.338 |
| -3.980000000000128 | 7.18 | 2.655 | 1.342 |
| -3.970000000000129 | 7.187 | 2.66 | 1.345 |
| -3.960000000000129 | 7.194 | 2.664 | 1.349 |
| -3.950000000000129 | 7.2 | 2.669 | 1.352 |
| -3.940000000000129 | 7.207 | 2.674 | 1.356 |
| -3.930000000000129 | 7.214 | 2.679 | 1.359 |
| -3.92000000000013 | 7.221 | 2.684 | 1.363 |
| -3.91000000000013 | 7.228 | 2.689 | 1.366 |
| -3.90000000000013 | 7.235 | 2.694 | 1.37 |
| -3.89000000000013 | 7.242 | 2.699 | 1.374 |
| -3.88000000000013 | 7.249 | 2.704 | 1.377 |
| -3.870000000000131 | 7.256 | 2.709 | 1.381 |
| -3.860000000000131 | 7.262 | 2.713 | 1.384 |
| -3.850000000000131 | 7.269 | 2.718 | 1.388 |
| -3.840000000000131 | 7.276 | 2.723 | 1.392 |
| -3.830000000000131 | 7.283 | 2.728 | 1.395 |
| -3.820000000000132 | 7.29 | 2.733 | 1.399 |
| -3.810000000000132 | 7.297 | 2.738 | 1.403 |
| -3.800000000000132 | 7.304 | 2.743 | 1.406 |
| -3.790000000000132 | 7.311 | 2.748 | 1.41 |
| -3.780000000000132 | 7.318 | 2.753 | 1.414 |
| -3.770000000000133 | 7.325 | 2.758 | 1.418 |
| -3.760000000000133 | 7.332 | 2.763 | 1.421 |
| -3.750000000000133 | 7.339 | 2.768 | 1.425 |
| -3.740000000000133 | 7.346 | 2.773 | 1.429 |
| -3.730000000000134 | 7.353 | 2.779 | 1.432 |
| -3.720000000000134 | 7.36 | 2.784 | 1.436 |
| -3.710000000000134 | 7.367 | 2.789 | 1.44 |
| -3.700000000000134 | 7.374 | 2.794 | 1.444 |
| -3.690000000000134 | 7.381 | 2.799 | 1.448 |
| -3.680000000000135 | 7.388 | 2.804 | 1.451 |
| -3.670000000000135 | 7.395 | 2.809 | 1.455 |
| -3.660000000000135 | 7.402 | 2.814 | 1.459 |
| -3.650000000000135 | 7.409 | 2.819 | 1.463 |
| -3.640000000000135 | 7.416 | 2.825 | 1.467 |
| -3.630000000000136 | 7.423 | 2.83 | 1.471 |
| -3.620000000000136 | 7.431 | 2.835 | 1.474 |
| -3.610000000000136 | 7.438 | 2.84 | 1.478 |
| -3.600000000000136 | 7.445 | 2.845 | 1.482 |
| -3.590000000000137 | 7.452 | 2.85 | 1.486 |
| -3.580000000000137 | 7.459 | 2.856 | 1.49 |
| -3.570000000000137 | 7.466 | 2.861 | 1.494 |
| -3.560000000000137 | 7.473 | 2.866 | 1.498 |
| -3.550000000000137 | 7.48 | 2.871 | 1.502 |
| -3.540000000000138 | 7.487 | 2.876 | 1.506 |
| -3.530000000000138 | 7.495 | 2.882 | 1.51 |
| -3.520000000000138 | 7.502 | 2.887 | 1.514 |
| -3.510000000000138 | 7.509 | 2.892 | 1.518 |
| -3.500000000000139 | 7.516 | 2.898 | 1.522 |
| -3.490000000000139 | 7.523 | 2.903 | 1.526 |
| -3.480000000000139 | 7.53 | 2.908 | 1.53 |
| -3.470000000000139 | 7.538 | 2.913 | 1.534 |
| -3.460000000000139 | 7.545 | 2.919 | 1.538 |
| -3.45000000000014 | 7.552 | 2.924 | 1.542 |
| -3.44000000000014 | 7.559 | 2.929 | 1.546 |
| -3.43000000000014 | 7.566 | 2.935 | 1.55 |
| -3.42000000000014 | 7.574 | 2.94 | 1.554 |
| -3.41000000000014 | 7.581 | 2.945 | 1.558 |
| -3.400000000000141 | 7.588 | 2.951 | 1.562 |
| -3.390000000000141 | 7.595 | 2.956 | 1.566 |
| -3.380000000000141 | 7.602 | 2.962 | 1.57 |
| -3.370000000000141 | 7.61 | 2.967 | 1.574 |
| -3.360000000000141 | 7.617 | 2.972 | 1.579 |
| -3.350000000000142 | 7.624 | 2.978 | 1.583 |
| -3.340000000000142 | 7.631 | 2.983 | 1.587 |
| -3.330000000000142 | 7.639 | 2.989 | 1.591 |
| -3.320000000000142 | 7.646 | 2.994 | 1.595 |
| -3.310000000000143 | 7.653 | 3 | 1.599 |
| -3.300000000000143 | 7.661 | 3.005 | 1.604 |
| -3.290000000000143 | 7.668 | 3.011 | 1.608 |
| -3.280000000000143 | 7.675 | 3.016 | 1.612 |
| -3.270000000000143 | 7.683 | 3.022 | 1.616 |
| -3.260000000000144 | 7.69 | 3.027 | 1.62 |
| -3.250000000000144 | 7.697 | 3.033 | 1.625 |
| -3.240000000000144 | 7.705 | 3.038 | 1.629 |
| -3.230000000000144 | 7.712 | 3.044 | 1.633 |
| -3.220000000000145 | 7.719 | 3.049 | 1.638 |
| -3.210000000000145 | 7.727 | 3.055 | 1.642 |
| -3.200000000000145 | 7.734 | 3.06 | 1.646 |
| -3.190000000000145 | 7.741 | 3.066 | 1.651 |
| -3.180000000000145 | 7.749 | 3.072 | 1.655 |
| -3.170000000000146 | 7.756 | 3.077 | 1.659 |
| -3.160000000000146 | 7.764 | 3.083 | 1.664 |
| -3.150000000000146 | 7.771 | 3.088 | 1.668 |
| -3.140000000000146 | 7.778 | 3.094 | 1.672 |
| -3.130000000000146 | 7.786 | 3.1 | 1.677 |
| -3.120000000000147 | 7.793 | 3.105 | 1.681 |
| -3.110000000000147 | 7.801 | 3.111 | 1.686 |
| -3.100000000000147 | 7.808 | 3.117 | 1.69 |
| -3.090000000000147 | 7.816 | 3.122 | 1.694 |
| -3.080000000000147 | 7.823 | 3.128 | 1.699 |
| -3.070000000000148 | 7.83 | 3.134 | 1.703 |
| -3.060000000000148 | 7.838 | 3.14 | 1.708 |
| -3.050000000000148 | 7.845 | 3.145 | 1.712 |
| -3.040000000000148 | 7.853 | 3.151 | 1.717 |
| -3.030000000000149 | 7.86 | 3.157 | 1.721 |
| -3.020000000000149 | 7.868 | 3.163 | 1.726 |
| -3.010000000000149 | 7.875 | 3.168 | 1.73 |
| -3.000000000000149 | 7.883 | 3.174 | 1.735 |
| -2.990000000000149 | 7.89 | 3.18 | 1.739 |
| -2.98000000000015 | 7.898 | 3.186 | 1.744 |
| -2.97000000000015 | 7.905 | 3.191 | 1.749 |
| -2.96000000000015 | 7.913 | 3.197 | 1.753 |
| -2.95000000000015 | 7.92 | 3.203 | 1.758 |
| -2.94000000000015 | 7.928 | 3.209 | 1.762 |
| -2.930000000000151 | 7.936 | 3.215 | 1.767 |
| -2.920000000000151 | 7.943 | 3.221 | 1.772 |
| -2.910000000000151 | 7.951 | 3.227 | 1.776 |
| -2.900000000000151 | 7.958 | 3.232 | 1.781 |
| -2.890000000000151 | 7.966 | 3.238 | 1.786 |
| -2.880000000000152 | 7.974 | 3.244 | 1.79 |
| -2.870000000000152 | 7.981 | 3.25 | 1.795 |
| -2.860000000000152 | 7.989 | 3.256 | 1.8 |
| -2.850000000000152 | 7.996 | 3.262 | 1.804 |
| -2.840000000000153 | 8.004 | 3.268 | 1.809 |
| -2.830000000000153 | 8.012 | 3.274 | 1.814 |
| -2.820000000000153 | 8.019 | 3.28 | 1.819 |
| -2.810000000000153 | 8.027 | 3.286 | 1.824 |
| -2.800000000000153 | 8.035 | 3.292 | 1.828 |
| -2.790000000000154 | 8.042 | 3.298 | 1.833 |
| -2.780000000000154 | 8.05 | 3.304 | 1.838 |
| -2.770000000000154 | 8.058 | 3.31 | 1.843 |
| -2.760000000000154 | 8.065 | 3.316 | 1.848 |
| -2.750000000000154 | 8.073 | 3.322 | 1.852 |
| -2.740000000000155 | 8.081 | 3.328 | 1.857 |
| -2.730000000000155 | 8.088 | 3.334 | 1.862 |
| -2.720000000000155 | 8.096 | 3.34 | 1.867 |
| -2.710000000000155 | 8.104 | 3.346 | 1.872 |
| -2.700000000000156 | 8.111 | 3.353 | 1.877 |
| -2.690000000000156 | 8.119 | 3.359 | 1.882 |
| -2.680000000000156 | 8.127 | 3.365 | 1.887 |
| -2.670000000000156 | 8.135 | 3.371 | 1.892 |
| -2.660000000000156 | 8.142 | 3.377 | 1.897 |
| -2.650000000000157 | 8.15 | 3.383 | 1.902 |
| -2.640000000000157 | 8.158 | 3.389 | 1.907 |
| -2.630000000000157 | 8.166 | 3.396 | 1.912 |
| -2.620000000000157 | 8.174 | 3.402 | 1.917 |
| -2.610000000000157 | 8.181 | 3.408 | 1.922 |
| -2.600000000000158 | 8.189 | 3.414 | 1.927 |
| -2.590000000000158 | 8.197 | 3.42 | 1.932 |
| -2.580000000000158 | 8.205 | 3.427 | 1.937 |
| -2.570000000000158 | 8.213 | 3.433 | 1.942 |
| -2.560000000000159 | 8.22 | 3.439 | 1.947 |
| -2.550000000000159 | 8.228 | 3.445 | 1.952 |
| -2.54000000000016 | 8.236 | 3.452 | 1.957 |
| -2.530000000000159 | 8.244 | 3.458 | 1.963 |
| -2.520000000000159 | 8.252 | 3.464 | 1.968 |
| -2.51000000000016 | 8.26 | 3.471 | 1.973 |
| -2.50000000000016 | 8.268 | 3.477 | 1.978 |
| -2.49000000000016 | 8.275 | 3.483 | 1.983 |
| -2.48000000000016 | 8.283 | 3.49 | 1.988 |
| -2.47000000000016 | 8.291 | 3.496 | 1.994 |
| -2.460000000000161 | 8.299 | 3.502 | 1.999 |
| -2.450000000000161 | 8.307 | 3.509 | 2.004 |
| -2.440000000000161 | 8.315 | 3.515 | 2.009 |
| -2.430000000000161 | 8.323 | 3.522 | 2.015 |
| -2.420000000000162 | 8.331 | 3.528 | 2.02 |
| -2.410000000000162 | 8.339 | 3.535 | 2.025 |
| -2.400000000000162 | 8.347 | 3.541 | 2.031 |
| -2.390000000000162 | 8.355 | 3.547 | 2.036 |
| -2.380000000000162 | 8.363 | 3.554 | 2.041 |
| -2.370000000000163 | 8.371 | 3.56 | 2.047 |
| -2.360000000000163 | 8.379 | 3.567 | 2.052 |
| -2.350000000000163 | 8.387 | 3.573 | 2.057 |
| -2.340000000000163 | 8.395 | 3.58 | 2.063 |
| -2.330000000000163 | 8.403 | 3.586 | 2.068 |
| -2.320000000000164 | 8.411 | 3.593 | 2.074 |
| -2.310000000000164 | 8.419 | 3.6 | 2.079 |
| -2.300000000000164 | 8.427 | 3.606 | 2.085 |
| -2.290000000000164 | 8.435 | 3.613 | 2.09 |
| -2.280000000000165 | 8.443 | 3.619 | 2.096 |
| -2.270000000000165 | 8.451 | 3.626 | 2.101 |
| -2.260000000000165 | 8.459 | 3.633 | 2.107 |
| -2.250000000000165 | 8.467 | 3.639 | 2.112 |
| -2.240000000000165 | 8.475 | 3.646 | 2.118 |
| -2.230000000000166 | 8.483 | 3.652 | 2.123 |
| -2.220000000000166 | 8.491 | 3.659 | 2.129 |
| -2.210000000000166 | 8.499 | 3.666 | 2.134 |
| -2.200000000000166 | 8.507 | 3.673 | 2.14 |
| -2.190000000000166 | 8.516 | 3.679 | 2.146 |
| -2.180000000000167 | 8.524 | 3.686 | 2.151 |
| -2.170000000000167 | 8.532 | 3.693 | 2.157 |
| -2.160000000000167 | 8.54 | 3.699 | 2.163 |
| -2.150000000000167 | 8.548 | 3.706 | 2.168 |
| -2.140000000000168 | 8.556 | 3.713 | 2.174 |
| -2.130000000000168 | 8.564 | 3.72 | 2.18 |
| -2.120000000000168 | 8.573 | 3.726 | 2.185 |
| -2.110000000000168 | 8.581 | 3.733 | 2.191 |
| -2.100000000000168 | 8.589 | 3.74 | 2.197 |
| -2.090000000000169 | 8.597 | 3.747 | 2.203 |
| -2.080000000000169 | 8.605 | 3.754 | 2.208 |
| -2.070000000000169 | 8.613 | 3.761 | 2.214 |
| -2.060000000000169 | 8.622 | 3.767 | 2.22 |
| -2.050000000000169 | 8.63 | 3.774 | 2.226 |
| -2.04000000000017 | 8.638 | 3.781 | 2.232 |
| -2.03000000000017 | 8.646 | 3.788 | 2.238 |
| -2.02000000000017 | 8.655 | 3.795 | 2.244 |
| -2.01000000000017 | 8.663 | 3.802 | 2.249 |
| -2.000000000000171 | 8.671 | 3.809 | 2.255 |
| -1.99000000000017 | 8.679 | 3.816 | 2.261 |
| -1.98000000000017 | 8.688 | 3.823 | 2.267 |
| -1.97000000000017 | 8.696 | 3.83 | 2.273 |
| -1.96000000000017 | 8.704 | 3.837 | 2.279 |
| -1.95000000000017 | 8.713 | 3.844 | 2.285 |
| -1.94000000000017 | 8.721 | 3.851 | 2.291 |
| -1.93000000000017 | 8.729 | 3.858 | 2.297 |
| -1.92000000000017 | 8.737 | 3.865 | 2.303 |
| -1.91000000000017 | 8.746 | 3.872 | 2.309 |
| -1.90000000000017 | 8.754 | 3.879 | 2.315 |
| -1.89000000000017 | 8.763 | 3.886 | 2.321 |
| -1.88000000000017 | 8.771 | 3.893 | 2.327 |
| -1.87000000000017 | 8.779 | 3.9 | 2.334 |
| -1.86000000000017 | 8.788 | 3.907 | 2.34 |
| -1.85000000000017 | 8.796 | 3.915 | 2.346 |
| -1.84000000000017 | 8.804 | 3.922 | 2.352 |
| -1.83000000000017 | 8.813 | 3.929 | 2.358 |
| -1.82000000000017 | 8.821 | 3.936 | 2.364 |
| -1.81000000000017 | 8.83 | 3.943 | 2.371 |
| -1.80000000000017 | 8.838 | 3.95 | 2.377 |
| -1.79000000000017 | 8.846 | 3.958 | 2.383 |
| -1.78000000000017 | 8.855 | 3.965 | 2.389 |
| -1.77000000000017 | 8.863 | 3.972 | 2.396 |
| -1.76000000000017 | 8.872 | 3.979 | 2.402 |
| -1.75000000000017 | 8.88 | 3.987 | 2.408 |
| -1.74000000000017 | 8.889 | 3.994 | 2.415 |
| -1.73000000000017 | 8.897 | 4.001 | 2.421 |
| -1.72000000000017 | 8.906 | 4.008 | 2.427 |
| -1.71000000000017 | 8.914 | 4.016 | 2.434 |
| -1.70000000000017 | 8.923 | 4.023 | 2.44 |
| -1.69000000000017 | 8.931 | 4.03 | 2.446 |
| -1.68000000000017 | 8.94 | 4.038 | 2.453 |
| -1.67000000000017 | 8.948 | 4.045 | 2.459 |
| -1.66000000000017 | 8.957 | 4.052 | 2.466 |
| -1.65000000000017 | 8.965 | 4.06 | 2.472 |
| -1.64000000000017 | 8.974 | 4.067 | 2.479 |
| -1.63000000000017 | 8.982 | 4.075 | 2.485 |
| -1.62000000000017 | 8.991 | 4.082 | 2.492 |
| -1.61000000000017 | 9 | 4.09 | 2.498 |
| -1.60000000000017 | 9.008 | 4.097 | 2.505 |
| -1.59000000000017 | 9.017 | 4.105 | 2.511 |
| -1.58000000000017 | 9.025 | 4.112 | 2.518 |
| -1.57000000000017 | 9.034 | 4.12 | 2.525 |
| -1.56000000000017 | 9.042 | 4.127 | 2.531 |
| -1.55000000000017 | 9.051 | 4.135 | 2.538 |
| -1.54000000000017 | 9.06 | 4.142 | 2.545 |
| -1.53000000000017 | 9.068 | 4.15 | 2.551 |
| -1.52000000000017 | 9.077 | 4.157 | 2.558 |
| -1.51000000000017 | 9.086 | 4.165 | 2.565 |
| -1.50000000000017 | 9.094 | 4.172 | 2.571 |
| -1.49000000000017 | 9.103 | 4.18 | 2.578 |
| -1.48000000000017 | 9.112 | 4.188 | 2.585 |
| -1.47000000000017 | 9.12 | 4.195 | 2.592 |
| -1.46000000000017 | 9.129 | 4.203 | 2.599 |
| -1.45000000000017 | 9.138 | 4.211 | 2.605 |
| -1.44000000000017 | 9.147 | 4.218 | 2.612 |
| -1.43000000000017 | 9.155 | 4.226 | 2.619 |
| -1.42000000000017 | 9.164 | 4.234 | 2.626 |
| -1.41000000000017 | 9.173 | 4.241 | 2.633 |
| -1.40000000000017 | 9.181 | 4.249 | 2.64 |
| -1.39000000000017 | 9.19 | 4.257 | 2.647 |
| -1.38000000000017 | 9.199 | 4.265 | 2.654 |
| -1.37000000000017 | 9.208 | 4.273 | 2.661 |
| -1.36000000000017 | 9.217 | 4.28 | 2.668 |
| -1.35000000000017 | 9.225 | 4.288 | 2.675 |
| -1.34000000000017 | 9.234 | 4.296 | 2.682 |
| -1.33000000000017 | 9.243 | 4.304 | 2.689 |
| -1.32000000000017 | 9.252 | 4.312 | 2.696 |
| -1.31000000000017 | 9.261 | 4.32 | 2.703 |
| -1.30000000000017 | 9.269 | 4.327 | 2.71 |
| -1.29000000000017 | 9.278 | 4.335 | 2.717 |
| -1.28000000000017 | 9.287 | 4.343 | 2.724 |
| -1.27000000000017 | 9.296 | 4.351 | 2.731 |
| -1.26000000000017 | 9.305 | 4.359 | 2.739 |
| -1.25000000000017 | 9.314 | 4.367 | 2.746 |
| -1.24000000000017 | 9.323 | 4.375 | 2.753 |
| -1.23000000000017 | 9.331 | 4.383 | 2.76 |
| -1.22000000000017 | 9.34 | 4.391 | 2.767 |
| -1.21000000000017 | 9.349 | 4.399 | 2.775 |
| -1.20000000000017 | 9.358 | 4.407 | 2.782 |
| -1.19000000000017 | 9.367 | 4.415 | 2.789 |
| -1.18000000000017 | 9.376 | 4.423 | 2.797 |
| -1.17000000000017 | 9.385 | 4.431 | 2.804 |
| -1.16000000000017 | 9.394 | 4.439 | 2.811 |
| -1.15000000000017 | 9.403 | 4.447 | 2.819 |
| -1.14000000000017 | 9.412 | 4.455 | 2.826 |
| -1.13000000000017 | 9.421 | 4.464 | 2.834 |
| -1.12000000000017 | 9.43 | 4.472 | 2.841 |
| -1.11000000000017 | 9.439 | 4.48 | 2.849 |
| -1.10000000000017 | 9.448 | 4.488 | 2.856 |
| -1.09000000000017 | 9.457 | 4.496 | 2.863 |
| -1.08000000000017 | 9.466 | 4.504 | 2.871 |
| -1.07000000000017 | 9.475 | 4.513 | 2.879 |
| -1.06000000000017 | 9.484 | 4.521 | 2.886 |
| -1.05000000000017 | 9.493 | 4.529 | 2.894 |
| -1.04000000000017 | 9.502 | 4.537 | 2.901 |
| -1.03000000000017 | 9.511 | 4.546 | 2.909 |
| -1.02000000000017 | 9.52 | 4.554 | 2.917 |
| -1.01000000000017 | 9.529 | 4.562 | 2.924 |
| -1.00000000000017 | 9.538 | 4.571 | 2.932 |
| -0.99000000000017 | 9.547 | 4.579 | 2.94 |
| -0.98000000000017 | 9.556 | 4.587 | 2.947 |
| -0.97000000000017 | 9.566 | 4.596 | 2.955 |
| -0.96000000000017 | 9.575 | 4.604 | 2.963 |
| -0.95000000000017 | 9.584 | 4.613 | 2.971 |
| -0.94000000000017 | 9.593 | 4.621 | 2.978 |
| -0.93000000000017 | 9.602 | 4.629 | 2.986 |
| -0.92000000000017 | 9.611 | 4.638 | 2.994 |
| -0.91000000000017 | 9.62 | 4.646 | 3.002 |
| -0.90000000000017 | 9.63 | 4.655 | 3.01 |
| -0.890000000000169 | 9.639 | 4.663 | 3.018 |
| -0.880000000000169 | 9.648 | 4.672 | 3.026 |
| -0.870000000000169 | 9.657 | 4.68 | 3.034 |
| -0.860000000000169 | 9.666 | 4.689 | 3.042 |
| -0.850000000000169 | 9.676 | 4.697 | 3.05 |
| -0.840000000000169 | 9.685 | 4.706 | 3.058 |
| -0.830000000000169 | 9.694 | 4.715 | 3.066 |
| -0.820000000000169 | 9.703 | 4.723 | 3.074 |
| -0.810000000000169 | 9.713 | 4.732 | 3.082 |
| -0.800000000000169 | 9.722 | 4.74 | 3.09 |
| -0.790000000000169 | 9.731 | 4.749 | 3.098 |
| -0.780000000000169 | 9.74 | 4.758 | 3.106 |
| -0.770000000000169 | 9.75 | 4.766 | 3.114 |
| -0.760000000000169 | 9.759 | 4.775 | 3.122 |
| -0.750000000000169 | 9.768 | 4.784 | 3.131 |
| -0.740000000000169 | 9.778 | 4.793 | 3.139 |
| -0.730000000000169 | 9.787 | 4.801 | 3.147 |
| -0.720000000000169 | 9.796 | 4.81 | 3.155 |
| -0.710000000000169 | 9.806 | 4.819 | 3.164 |
| -0.700000000000169 | 9.815 | 4.828 | 3.172 |
| -0.690000000000169 | 9.824 | 4.836 | 3.18 |
| -0.680000000000169 | 9.834 | 4.845 | 3.189 |
| -0.670000000000169 | 9.843 | 4.854 | 3.197 |
| -0.660000000000169 | 9.852 | 4.863 | 3.205 |
| -0.650000000000169 | 9.862 | 4.872 | 3.214 |
| -0.640000000000169 | 9.871 | 4.881 | 3.222 |
| -0.630000000000169 | 9.881 | 4.89 | 3.231 |
| -0.620000000000169 | 9.89 | 4.899 | 3.239 |
| -0.610000000000169 | 9.899 | 4.908 | 3.248 |
| -0.600000000000169 | 9.909 | 4.916 | 3.256 |
| -0.590000000000169 | 9.918 | 4.925 | 3.265 |
| -0.580000000000169 | 9.928 | 4.934 | 3.273 |
| -0.570000000000169 | 9.937 | 4.943 | 3.282 |
| -0.560000000000169 | 9.947 | 4.952 | 3.291 |
| -0.550000000000169 | 9.956 | 4.961 | 3.299 |
| -0.540000000000169 | 9.966 | 4.971 | 3.308 |
| -0.530000000000169 | 9.975 | 4.98 | 3.317 |
| -0.520000000000169 | 9.985 | 4.989 | 3.325 |
| -0.510000000000169 | 9.994 | 4.998 | 3.334 |
| -0.500000000000169 | 10.004 | 5.007 | 3.343 |
| -0.490000000000169 | 10.013 | 5.016 | 3.352 |
| -0.480000000000169 | 10.023 | 5.025 | 3.36 |
| -0.470000000000169 | 10.032 | 5.034 | 3.369 |
| -0.460000000000169 | 10.042 | 5.044 | 3.378 |
| -0.450000000000169 | 10.052 | 5.053 | 3.387 |
| -0.440000000000169 | 10.061 | 5.062 | 3.396 |
| -0.430000000000169 | 10.071 | 5.071 | 3.405 |
| -0.420000000000169 | 10.08 | 5.08 | 3.414 |
| -0.410000000000169 | 10.09 | 5.09 | 3.423 |
| -0.400000000000169 | 10.1 | 5.099 | 3.432 |
| -0.390000000000169 | 10.109 | 5.108 | 3.441 |
| -0.380000000000169 | 10.119 | 5.118 | 3.45 |
| -0.370000000000169 | 10.129 | 5.127 | 3.459 |
| -0.360000000000169 | 10.138 | 5.136 | 3.468 |
| -0.350000000000169 | 10.148 | 5.146 | 3.477 |
| -0.340000000000169 | 10.158 | 5.155 | 3.486 |
| -0.330000000000169 | 10.167 | 5.165 | 3.495 |
| -0.320000000000169 | 10.177 | 5.174 | 3.505 |
| -0.310000000000169 | 10.187 | 5.183 | 3.514 |
| -0.300000000000169 | 10.196 | 5.193 | 3.523 |
| -0.290000000000169 | 10.206 | 5.202 | 3.532 |
| -0.280000000000169 | 10.216 | 5.212 | 3.542 |
| -0.270000000000169 | 10.226 | 5.221 | 3.551 |
| -0.260000000000169 | 10.235 | 5.231 | 3.56 |
| -0.250000000000169 | 10.245 | 5.24 | 3.57 |
| -0.240000000000169 | 10.255 | 5.25 | 3.579 |
| -0.230000000000169 | 10.265 | 5.26 | 3.588 |
| -0.220000000000169 | 10.274 | 5.269 | 3.598 |
| -0.210000000000169 | 10.284 | 5.279 | 3.607 |
| -0.200000000000169 | 10.294 | 5.288 | 3.617 |
| -0.190000000000169 | 10.304 | 5.298 | 3.626 |
| -0.180000000000169 | 10.314 | 5.308 | 3.636 |
| -0.170000000000169 | 10.323 | 5.317 | 3.645 |
| -0.160000000000169 | 10.333 | 5.327 | 3.655 |
| -0.150000000000169 | 10.343 | 5.337 | 3.664 |
| -0.140000000000169 | 10.353 | 5.347 | 3.674 |
| -0.130000000000169 | 10.363 | 5.356 | 3.684 |
| -0.120000000000169 | 10.373 | 5.366 | 3.693 |
| -0.110000000000169 | 10.383 | 5.376 | 3.703 |
| -0.100000000000169 | 10.393 | 5.386 | 3.713 |
| -0.0900000000001689 | 10.402 | 5.396 | 3.723 |
| -0.0800000000001689 | 10.412 | 5.405 | 3.732 |
| -0.0700000000001689 | 10.422 | 5.415 | 3.742 |
| -0.0600000000001689 | 10.432 | 5.425 | 3.752 |
| -0.0500000000001689 | 10.442 | 5.435 | 3.762 |
| -0.0400000000001689 | 10.452 | 5.445 | 3.772 |
| -0.0300000000001689 | 10.462 | 5.455 | 3.782 |
| -0.0200000000001689 | 10.472 | 5.465 | 3.792 |
| -0.0100000000001689 | 10.482 | 5.475 | 3.802 |
| -1.6888920817415e-13 | 10.492 | 5.485 | 3.811 |
| 0.00999999999983111 | 10.502 | 5.495 | 3.822 |
| 0.0199999999998311 | 10.512 | 5.505 | 3.832 |
| 0.0299999999998311 | 10.522 | 5.515 | 3.842 |
| 0.0399999999998311 | 10.532 | 5.525 | 3.852 |
| 0.0499999999998311 | 10.542 | 5.535 | 3.862 |
| 0.0599999999998311 | 10.552 | 5.545 | 3.872 |
| 0.0699999999998311 | 10.562 | 5.555 | 3.882 |
| 0.0799999999998311 | 10.572 | 5.565 | 3.892 |
| 0.0899999999998311 | 10.582 | 5.576 | 3.903 |
| 0.0999999999998311 | 10.593 | 5.586 | 3.913 |
| 0.109999999999831 | 10.603 | 5.596 | 3.923 |
| 0.119999999999831 | 10.613 | 5.606 | 3.933 |
| 0.129999999999831 | 10.623 | 5.616 | 3.944 |
| 0.139999999999831 | 10.633 | 5.627 | 3.954 |
| 0.149999999999831 | 10.643 | 5.637 | 3.964 |
| 0.159999999999831 | 10.653 | 5.647 | 3.975 |
| 0.169999999999831 | 10.663 | 5.657 | 3.985 |
| 0.179999999999831 | 10.674 | 5.668 | 3.996 |
| 0.189999999999831 | 10.684 | 5.678 | 4.006 |
| 0.199999999999831 | 10.694 | 5.689 | 4.017 |
| 0.209999999999831 | 10.704 | 5.699 | 4.027 |
| 0.219999999999831 | 10.714 | 5.709 | 4.038 |
| 0.229999999999831 | 10.725 | 5.72 | 4.049 |
| 0.239999999999831 | 10.735 | 5.73 | 4.059 |
| 0.249999999999831 | 10.745 | 5.741 | 4.07 |
| 0.259999999999831 | 10.755 | 5.751 | 4.081 |
| 0.269999999999831 | 10.766 | 5.762 | 4.091 |
| 0.279999999999831 | 10.776 | 5.772 | 4.102 |
| 0.289999999999831 | 10.786 | 5.783 | 4.113 |
| 0.299999999999831 | 10.796 | 5.793 | 4.124 |
| 0.309999999999831 | 10.807 | 5.804 | 4.134 |
| 0.319999999999831 | 10.817 | 5.814 | 4.145 |
| 0.329999999999831 | 10.827 | 5.825 | 4.156 |
| 0.339999999999831 | 10.838 | 5.836 | 4.167 |
| 0.349999999999831 | 10.848 | 5.846 | 4.178 |
| 0.359999999999831 | 10.858 | 5.857 | 4.189 |
| 0.369999999999831 | 10.869 | 5.868 | 4.2 |
| 0.379999999999831 | 10.879 | 5.878 | 4.211 |
| 0.389999999999831 | 10.889 | 5.889 | 4.222 |
| 0.399999999999831 | 10.9 | 5.9 | 4.233 |
| 0.409999999999831 | 10.91 | 5.911 | 4.244 |
| 0.419999999999831 | 10.921 | 5.921 | 4.256 |
| 0.429999999999831 | 10.931 | 5.932 | 4.267 |
| 0.439999999999831 | 10.941 | 5.943 | 4.278 |
| 0.449999999999831 | 10.952 | 5.954 | 4.289 |
| 0.459999999999831 | 10.962 | 5.965 | 4.3 |
| 0.469999999999831 | 10.973 | 5.976 | 4.312 |
| 0.479999999999831 | 10.983 | 5.986 | 4.323 |
| 0.489999999999831 | 10.994 | 5.997 | 4.334 |
| 0.499999999999831 | 11.004 | 6.008 | 4.346 |
| 0.509999999999831 | 11.015 | 6.019 | 4.357 |
| 0.519999999999831 | 11.025 | 6.03 | 4.369 |
| 0.529999999999831 | 11.036 | 6.041 | 4.38 |
| 0.539999999999831 | 11.046 | 6.052 | 4.392 |
| 0.549999999999831 | 11.057 | 6.063 | 4.403 |
| 0.559999999999831 | 11.067 | 6.074 | 4.415 |
| 0.569999999999831 | 11.078 | 6.085 | 4.426 |
| 0.579999999999831 | 11.088 | 6.097 | 4.438 |
| 0.589999999999831 | 11.099 | 6.108 | 4.45 |
| 0.599999999999831 | 11.11 | 6.119 | 4.461 |
| 0.609999999999831 | 11.12 | 6.13 | 4.473 |
| 0.619999999999831 | 11.131 | 6.141 | 4.485 |
| 0.629999999999831 | 11.141 | 6.152 | 4.497 |
| 0.639999999999831 | 11.152 | 6.164 | 4.508 |
| 0.649999999999831 | 11.163 | 6.175 | 4.52 |
| 0.659999999999831 | 11.173 | 6.186 | 4.532 |
| 0.669999999999831 | 11.184 | 6.197 | 4.544 |
| 0.679999999999831 | 11.195 | 6.209 | 4.556 |
| 0.689999999999831 | 11.205 | 6.22 | 4.568 |
| 0.699999999999831 | 11.216 | 6.231 | 4.58 |
| 0.709999999999831 | 11.227 | 6.243 | 4.592 |
| 0.719999999999831 | 11.237 | 6.254 | 4.604 |
| 0.729999999999831 | 11.248 | 6.266 | 4.616 |
| 0.739999999999831 | 11.259 | 6.277 | 4.628 |
| 0.749999999999832 | 11.27 | 6.289 | 4.64 |
| 0.759999999999832 | 11.28 | 6.3 | 4.653 |
| 0.769999999999832 | 11.291 | 6.311 | 4.665 |
| 0.779999999999832 | 11.302 | 6.323 | 4.677 |
| 0.789999999999832 | 11.313 | 6.335 | 4.689 |
| 0.799999999999832 | 11.323 | 6.346 | 4.702 |
| 0.809999999999832 | 11.334 | 6.358 | 4.714 |
| 0.819999999999832 | 11.345 | 6.369 | 4.726 |
| 0.829999999999832 | 11.356 | 6.381 | 4.739 |
| 0.839999999999832 | 11.367 | 6.393 | 4.751 |
| 0.849999999999832 | 11.377 | 6.404 | 4.764 |
| 0.859999999999832 | 11.388 | 6.416 | 4.776 |
| 0.869999999999832 | 11.399 | 6.428 | 4.789 |
| 0.879999999999832 | 11.41 | 6.439 | 4.801 |
| 0.889999999999832 | 11.421 | 6.451 | 4.814 |
| 0.899999999999832 | 11.432 | 6.463 | 4.827 |
| 0.909999999999832 | 11.443 | 6.475 | 4.839 |
| 0.919999999999832 | 11.454 | 6.486 | 4.852 |
| 0.929999999999832 | 11.465 | 6.498 | 4.865 |
| 0.939999999999832 | 11.475 | 6.51 | 4.878 |
| 0.949999999999832 | 11.486 | 6.522 | 4.89 |
| 0.959999999999832 | 11.497 | 6.534 | 4.903 |
| 0.969999999999832 | 11.508 | 6.546 | 4.916 |
| 0.979999999999832 | 11.519 | 6.558 | 4.929 |
| 0.989999999999832 | 11.53 | 6.57 | 4.942 |
| 0.999999999999832 | 11.541 | 6.582 | 4.955 |
| 1.009999999999832 | 11.552 | 6.594 | 4.968 |
| 1.019999999999832 | 11.563 | 6.606 | 4.981 |
| 1.029999999999832 | 11.574 | 6.618 | 4.994 |
| 1.039999999999832 | 11.585 | 6.63 | 5.007 |
| 1.049999999999832 | 11.596 | 6.642 | 5.02 |
| 1.059999999999832 | 11.607 | 6.654 | 5.034 |
| 1.069999999999832 | 11.619 | 6.666 | 5.047 |
| 1.079999999999832 | 11.63 | 6.678 | 5.06 |
| 1.089999999999832 | 11.641 | 6.691 | 5.073 |
| 1.099999999999832 | 11.652 | 6.703 | 5.087 |
| 1.109999999999832 | 11.663 | 6.715 | 5.1 |
| 1.119999999999832 | 11.674 | 6.727 | 5.113 |
| 1.129999999999832 | 11.685 | 6.74 | 5.127 |
| 1.139999999999832 | 11.696 | 6.752 | 5.14 |
| 1.149999999999832 | 11.707 | 6.764 | 5.154 |
| 1.159999999999832 | 11.719 | 6.777 | 5.167 |
| 1.169999999999832 | 11.73 | 6.789 | 5.181 |
| 1.179999999999832 | 11.741 | 6.801 | 5.195 |
| 1.189999999999832 | 11.752 | 6.814 | 5.208 |
| 1.199999999999832 | 11.763 | 6.826 | 5.222 |
| 1.209999999999832 | 11.775 | 6.839 | 5.236 |
| 1.219999999999832 | 11.786 | 6.851 | 5.249 |
| 1.229999999999832 | 11.797 | 6.864 | 5.263 |
| 1.239999999999832 | 11.808 | 6.876 | 5.277 |
| 1.249999999999832 | 11.82 | 6.889 | 5.291 |
| 1.259999999999832 | 11.831 | 6.901 | 5.305 |
| 1.269999999999832 | 11.842 | 6.914 | 5.319 |
| 1.279999999999832 | 11.853 | 6.927 | 5.333 |
| 1.289999999999832 | 11.865 | 6.939 | 5.347 |
| 1.299999999999832 | 11.876 | 6.952 | 5.361 |
| 1.309999999999832 | 11.887 | 6.964 | 5.375 |
| 1.319999999999832 | 11.899 | 6.977 | 5.389 |
| 1.329999999999832 | 11.91 | 6.99 | 5.403 |
| 1.339999999999832 | 11.921 | 7.003 | 5.417 |
| 1.349999999999832 | 11.933 | 7.015 | 5.431 |
| 1.359999999999832 | 11.944 | 7.028 | 5.446 |
| 1.369999999999832 | 11.956 | 7.041 | 5.46 |
| 1.379999999999832 | 11.967 | 7.054 | 5.474 |
| 1.389999999999832 | 11.978 | 7.067 | 5.489 |
| 1.399999999999832 | 11.99 | 7.08 | 5.503 |
| 1.409999999999832 | 12.001 | 7.093 | 5.518 |
| 1.419999999999832 | 12.013 | 7.106 | 5.532 |
| 1.429999999999832 | 12.024 | 7.119 | 5.547 |
| 1.439999999999832 | 12.036 | 7.132 | 5.561 |
| 1.449999999999832 | 12.047 | 7.145 | 5.576 |
| 1.459999999999832 | 12.059 | 7.158 | 5.591 |
| 1.469999999999832 | 12.07 | 7.171 | 5.605 |
| 1.479999999999832 | 12.082 | 7.184 | 5.62 |
| 1.489999999999832 | 12.093 | 7.197 | 5.635 |
| 1.499999999999832 | 12.105 | 7.21 | 5.65 |
| 1.509999999999832 | 12.116 | 7.223 | 5.664 |
| 1.519999999999832 | 12.128 | 7.236 | 5.679 |
| 1.529999999999832 | 12.139 | 7.25 | 5.694 |
| 1.539999999999832 | 12.151 | 7.263 | 5.709 |
| 1.549999999999832 | 12.162 | 7.276 | 5.724 |
| 1.559999999999832 | 12.174 | 7.289 | 5.739 |
| 1.569999999999832 | 12.186 | 7.303 | 5.754 |
| 1.579999999999832 | 12.197 | 7.316 | 5.769 |
| 1.589999999999832 | 12.209 | 7.329 | 5.784 |
| 1.599999999999832 | 12.221 | 7.343 | 5.8 |
| 1.609999999999832 | 12.232 | 7.356 | 5.815 |
| 1.619999999999832 | 12.244 | 7.369 | 5.83 |
| 1.629999999999832 | 12.255 | 7.383 | 5.846 |
| 1.639999999999832 | 12.267 | 7.396 | 5.861 |
| 1.649999999999832 | 12.279 | 7.41 | 5.876 |
| 1.659999999999832 | 12.291 | 7.423 | 5.892 |
| 1.669999999999832 | 12.302 | 7.437 | 5.907 |
| 1.679999999999832 | 12.314 | 7.451 | 5.923 |
| 1.689999999999832 | 12.326 | 7.464 | 5.938 |
| 1.699999999999832 | 12.338 | 7.478 | 5.954 |
| 1.709999999999832 | 12.349 | 7.491 | 5.97 |
| 1.719999999999832 | 12.361 | 7.505 | 5.985 |
| 1.729999999999832 | 12.373 | 7.519 | 6.001 |
| 1.739999999999832 | 12.385 | 7.532 | 6.017 |
| 1.749999999999832 | 12.396 | 7.546 | 6.032 |
| 1.759999999999832 | 12.408 | 7.56 | 6.048 |
| 1.769999999999832 | 12.42 | 7.574 | 6.064 |
| 1.779999999999832 | 12.432 | 7.588 | 6.08 |
| 1.789999999999832 | 12.444 | 7.601 | 6.096 |
| 1.799999999999832 | 12.456 | 7.615 | 6.112 |
| 1.809999999999832 | 12.468 | 7.629 | 6.128 |
| 1.819999999999832 | 12.479 | 7.643 | 6.144 |
| 1.829999999999832 | 12.491 | 7.657 | 6.16 |
| 1.839999999999832 | 12.503 | 7.671 | 6.177 |
| 1.849999999999832 | 12.515 | 7.685 | 6.193 |
| 1.859999999999832 | 12.527 | 7.699 | 6.209 |
| 1.869999999999832 | 12.539 | 7.713 | 6.225 |
| 1.879999999999832 | 12.551 | 7.727 | 6.242 |
| 1.889999999999832 | 12.563 | 7.741 | 6.258 |
| 1.899999999999832 | 12.575 | 7.755 | 6.275 |
| 1.909999999999832 | 12.587 | 7.77 | 6.291 |
| 1.919999999999832 | 12.599 | 7.784 | 6.308 |
| 1.929999999999832 | 12.611 | 7.798 | 6.324 |
| 1.939999999999832 | 12.623 | 7.812 | 6.341 |
| 1.949999999999833 | 12.635 | 7.826 | 6.357 |
| 1.959999999999833 | 12.647 | 7.841 | 6.374 |
| 1.969999999999833 | 12.659 | 7.855 | 6.391 |
| 1.979999999999833 | 12.671 | 7.869 | 6.408 |
| 1.989999999999833 | 12.683 | 7.884 | 6.425 |
| 1.999999999999833 | 12.695 | 7.898 | 6.441 |
| 2.009999999999832 | 12.707 | 7.913 | 6.458 |
| 2.019999999999832 | 12.72 | 7.927 | 6.475 |
| 2.029999999999832 | 12.732 | 7.941 | 6.492 |
| 2.039999999999832 | 12.744 | 7.956 | 6.509 |
| 2.049999999999832 | 12.756 | 7.97 | 6.526 |
| 2.059999999999831 | 12.768 | 7.985 | 6.544 |
| 2.069999999999831 | 12.78 | 8 | 6.561 |
| 2.079999999999831 | 12.793 | 8.014 | 6.578 |
| 2.089999999999831 | 12.805 | 8.029 | 6.595 |
| 2.09999999999983 | 12.817 | 8.043 | 6.613 |
| 2.10999999999983 | 12.829 | 8.058 | 6.63 |
| 2.11999999999983 | 12.841 | 8.073 | 6.647 |
| 2.12999999999983 | 12.854 | 8.088 | 6.665 |
| 2.13999999999983 | 12.866 | 8.102 | 6.682 |
| 2.149999999999829 | 12.878 | 8.117 | 6.7 |
| 2.159999999999829 | 12.89 | 8.132 | 6.718 |
| 2.169999999999829 | 12.903 | 8.147 | 6.735 |
| 2.179999999999829 | 12.915 | 8.162 | 6.753 |
| 2.189999999999829 | 12.927 | 8.177 | 6.771 |
| 2.199999999999828 | 12.94 | 8.191 | 6.788 |
| 2.209999999999828 | 12.952 | 8.206 | 6.806 |
| 2.219999999999828 | 12.964 | 8.221 | 6.824 |
| 2.229999999999828 | 12.977 | 8.236 | 6.842 |
| 2.239999999999827 | 12.989 | 8.251 | 6.86 |
| 2.249999999999827 | 13.002 | 8.266 | 6.878 |
| 2.259999999999827 | 13.014 | 8.282 | 6.896 |
| 2.269999999999827 | 13.026 | 8.297 | 6.914 |
| 2.279999999999827 | 13.039 | 8.312 | 6.932 |
| 2.289999999999826 | 13.051 | 8.327 | 6.951 |
| 2.299999999999826 | 13.064 | 8.342 | 6.969 |
| 2.309999999999826 | 13.076 | 8.357 | 6.987 |
| 2.319999999999826 | 13.089 | 8.373 | 7.006 |
| 2.329999999999825 | 13.101 | 8.388 | 7.024 |
| 2.339999999999825 | 13.114 | 8.403 | 7.042 |
| 2.349999999999825 | 13.126 | 8.419 | 7.061 |
| 2.359999999999825 | 13.139 | 8.434 | 7.079 |
| 2.369999999999825 | 13.151 | 8.449 | 7.098 |
| 2.379999999999824 | 13.164 | 8.465 | 7.117 |
| 2.389999999999824 | 13.176 | 8.48 | 7.135 |
| 2.399999999999824 | 13.189 | 8.496 | 7.154 |
| 2.409999999999824 | 13.201 | 8.511 | 7.173 |
| 2.419999999999824 | 13.214 | 8.527 | 7.192 |
| 2.429999999999823 | 13.226 | 8.542 | 7.211 |
| 2.439999999999823 | 13.239 | 8.558 | 7.23 |
| 2.449999999999823 | 13.252 | 8.573 | 7.249 |
| 2.459999999999823 | 13.264 | 8.589 | 7.268 |
| 2.469999999999823 | 13.277 | 8.605 | 7.287 |
| 2.479999999999822 | 13.29 | 8.62 | 7.306 |
| 2.489999999999822 | 13.302 | 8.636 | 7.325 |
| 2.499999999999822 | 13.315 | 8.652 | 7.344 |
| 2.509999999999822 | 13.328 | 8.668 | 7.364 |
| 2.519999999999821 | 13.34 | 8.684 | 7.383 |
| 2.529999999999821 | 13.353 | 8.699 | 7.402 |
| 2.539999999999821 | 13.366 | 8.715 | 7.422 |
| 2.549999999999821 | 13.379 | 8.731 | 7.441 |
| 2.559999999999821 | 13.391 | 8.747 | 7.461 |
| 2.56999999999982 | 13.404 | 8.763 | 7.48 |
| 2.57999999999982 | 13.417 | 8.779 | 7.5 |
| 2.58999999999982 | 13.43 | 8.795 | 7.52 |
| 2.59999999999982 | 13.443 | 8.811 | 7.54 |
| 2.609999999999819 | 13.455 | 8.827 | 7.559 |
| 2.619999999999819 | 13.468 | 8.843 | 7.579 |
| 2.629999999999819 | 13.481 | 8.859 | 7.599 |
| 2.639999999999819 | 13.494 | 8.876 | 7.619 |
| 2.649999999999819 | 13.507 | 8.892 | 7.639 |
| 2.659999999999818 | 13.52 | 8.908 | 7.659 |
| 2.669999999999818 | 13.533 | 8.924 | 7.679 |
| 2.679999999999818 | 13.545 | 8.941 | 7.7 |
| 2.689999999999818 | 13.558 | 8.957 | 7.72 |
| 2.699999999999818 | 13.571 | 8.973 | 7.74 |
| 2.709999999999817 | 13.584 | 8.99 | 7.76 |
| 2.719999999999817 | 13.597 | 9.006 | 7.781 |
| 2.729999999999817 | 13.61 | 9.022 | 7.801 |
| 2.739999999999817 | 13.623 | 9.039 | 7.822 |
| 2.749999999999817 | 13.636 | 9.055 | 7.842 |
| 2.759999999999816 | 13.649 | 9.072 | 7.863 |
| 2.769999999999816 | 13.662 | 9.089 | 7.883 |
| 2.779999999999816 | 13.675 | 9.105 | 7.904 |
| 2.789999999999816 | 13.688 | 9.122 | 7.925 |
| 2.799999999999815 | 13.701 | 9.138 | 7.946 |
| 2.809999999999815 | 13.714 | 9.155 | 7.967 |
| 2.819999999999815 | 13.727 | 9.172 | 7.988 |
| 2.829999999999815 | 13.74 | 9.189 | 8.009 |
| 2.839999999999815 | 13.754 | 9.205 | 8.03 |
| 2.849999999999814 | 13.767 | 9.222 | 8.051 |
| 2.859999999999814 | 13.78 | 9.239 | 8.072 |
| 2.869999999999814 | 13.793 | 9.256 | 8.093 |
| 2.879999999999814 | 13.806 | 9.273 | 8.114 |
| 2.889999999999814 | 13.819 | 9.29 | 8.136 |
| 2.899999999999813 | 13.832 | 9.307 | 8.157 |
| 2.909999999999813 | 13.846 | 9.324 | 8.178 |
| 2.919999999999813 | 13.859 | 9.341 | 8.2 |
| 2.929999999999813 | 13.872 | 9.358 | 8.221 |
| 2.939999999999813 | 13.885 | 9.375 | 8.243 |
| 2.949999999999812 | 13.899 | 9.392 | 8.265 |
| 2.959999999999812 | 13.912 | 9.409 | 8.286 |
| 2.969999999999812 | 13.925 | 9.426 | 8.308 |
| 2.979999999999812 | 13.938 | 9.443 | 8.33 |
| 2.989999999999811 | 13.952 | 9.46 | 8.352 |
| 2.999999999999811 | 13.965 | 9.478 | 8.374 |
| 3.009999999999811 | 13.978 | 9.495 | 8.396 |
| 3.019999999999811 | 13.992 | 9.512 | 8.418 |
| 3.029999999999811 | 14.005 | 9.53 | 8.44 |
| 3.03999999999981 | 14.018 | 9.547 | 8.462 |
| 3.04999999999981 | 14.032 | 9.565 | 8.484 |
| 3.05999999999981 | 14.045 | 9.582 | 8.507 |
| 3.06999999999981 | 14.058 | 9.599 | 8.529 |
| 3.07999999999981 | 14.072 | 9.617 | 8.551 |
| 3.089999999999809 | 14.085 | 9.635 | 8.574 |
| 3.099999999999809 | 14.099 | 9.652 | 8.596 |
| 3.109999999999809 | 14.112 | 9.67 | 8.619 |
| 3.119999999999809 | 14.126 | 9.687 | 8.642 |
| 3.129999999999808 | 14.139 | 9.705 | 8.664 |
| 3.139999999999808 | 14.153 | 9.723 | 8.687 |
| 3.149999999999808 | 14.166 | 9.741 | 8.71 |
| 3.159999999999808 | 14.18 | 9.758 | 8.733 |
| 3.169999999999808 | 14.193 | 9.776 | 8.756 |
| 3.179999999999807 | 14.207 | 9.794 | 8.779 |
| 3.189999999999807 | 14.22 | 9.812 | 8.802 |
| 3.199999999999807 | 14.234 | 9.83 | 8.825 |
| 3.209999999999807 | 14.247 | 9.848 | 8.848 |
| 3.219999999999807 | 14.261 | 9.866 | 8.871 |
| 3.229999999999806 | 14.274 | 9.884 | 8.895 |
| 3.239999999999806 | 14.288 | 9.902 | 8.918 |
| 3.249999999999806 | 14.302 | 9.92 | 8.942 |
| 3.259999999999806 | 14.315 | 9.938 | 8.965 |
| 3.269999999999805 | 14.329 | 9.956 | 8.989 |
| 3.279999999999805 | 14.343 | 9.974 | 9.012 |
| 3.289999999999805 | 14.356 | 9.992 | 9.036 |
| 3.299999999999805 | 14.37 | 10.011 | 9.06 |
| 3.309999999999805 | 14.384 | 10.029 | 9.083 |
| 3.319999999999804 | 14.397 | 10.047 | 9.107 |
| 3.329999999999804 | 14.411 | 10.066 | 9.131 |
| 3.339999999999804 | 14.425 | 10.084 | 9.155 |
| 3.349999999999804 | 14.439 | 10.102 | 9.179 |
| 3.359999999999804 | 14.452 | 10.121 | 9.203 |
| 3.369999999999803 | 14.466 | 10.139 | 9.228 |
| 3.379999999999803 | 14.48 | 10.158 | 9.252 |
| 3.389999999999803 | 14.494 | 10.176 | 9.276 |
| 3.399999999999803 | 14.508 | 10.195 | 9.3 |
| 3.409999999999802 | 14.521 | 10.213 | 9.325 |
| 3.419999999999802 | 14.535 | 10.232 | 9.349 |
| 3.429999999999802 | 14.549 | 10.251 | 9.374 |
| 3.439999999999802 | 14.563 | 10.269 | 9.399 |
| 3.449999999999802 | 14.577 | 10.288 | 9.423 |
| 3.459999999999801 | 14.591 | 10.307 | 9.448 |
| 3.469999999999801 | 14.605 | 10.326 | 9.473 |
| 3.479999999999801 | 14.619 | 10.345 | 9.498 |
| 3.489999999999801 | 14.633 | 10.363 | 9.523 |
| 3.499999999999801 | 14.647 | 10.382 | 9.548 |
| 3.5099999999998 | 14.661 | 10.401 | 9.573 |
| 3.5199999999998 | 14.674 | 10.42 | 9.598 |
| 3.5299999999998 | 14.688 | 10.439 | 9.623 |
| 3.5399999999998 | 14.702 | 10.458 | 9.648 |
| 3.5499999999998 | 14.717 | 10.477 | 9.674 |
| 3.559999999999799 | 14.731 | 10.497 | 9.699 |
| 3.569999999999799 | 14.745 | 10.516 | 9.725 |
| 3.579999999999799 | 14.759 | 10.535 | 9.75 |
| 3.589999999999799 | 14.773 | 10.554 | 9.776 |
| 3.599999999999798 | 14.787 | 10.573 | 9.801 |
| 3.609999999999798 | 14.801 | 10.593 | 9.827 |
| 3.619999999999798 | 14.815 | 10.612 | 9.853 |
| 3.629999999999798 | 14.829 | 10.631 | 9.879 |
| 3.639999999999798 | 14.843 | 10.651 | 9.905 |
| 3.649999999999797 | 14.857 | 10.67 | 9.931 |
| 3.659999999999797 | 14.872 | 10.69 | 9.957 |
| 3.669999999999797 | 14.886 | 10.709 | 9.983 |
| 3.679999999999797 | 14.9 | 10.729 | 10.009 |
| 3.689999999999796 | 14.914 | 10.748 | 10.036 |
| 3.699999999999796 | 14.928 | 10.768 | 10.062 |
| 3.709999999999796 | 14.943 | 10.788 | 10.088 |
| 3.719999999999796 | 14.957 | 10.807 | 10.115 |
| 3.729999999999796 | 14.971 | 10.827 | 10.142 |
| 3.739999999999795 | 14.985 | 10.847 | 10.168 |
| 3.749999999999795 | 15 | 10.867 | 10.195 |
| 3.759999999999795 | 15.014 | 10.886 | 10.222 |
| 3.769999999999795 | 15.028 | 10.906 | 10.249 |
| 3.779999999999795 | 15.043 | 10.926 | 10.275 |
| 3.789999999999794 | 15.057 | 10.946 | 10.302 |
| 3.799999999999794 | 15.071 | 10.966 | 10.33 |
| 3.809999999999794 | 15.086 | 10.986 | 10.357 |
| 3.819999999999794 | 15.1 | 11.006 | 10.384 |
| 3.829999999999794 | 15.115 | 11.026 | 10.411 |
| 3.839999999999793 | 15.129 | 11.046 | 10.438 |
| 3.849999999999793 | 15.143 | 11.066 | 10.466 |
| 3.859999999999793 | 15.158 | 11.087 | 10.493 |
| 3.869999999999793 | 15.172 | 11.107 | 10.521 |
| 3.879999999999792 | 15.187 | 11.127 | 10.549 |
| 3.889999999999792 | 15.201 | 11.147 | 10.576 |
| 3.899999999999792 | 15.216 | 11.168 | 10.604 |
| 3.909999999999792 | 15.23 | 11.188 | 10.632 |
| 3.919999999999792 | 15.245 | 11.209 | 10.66 |
| 3.929999999999791 | 15.259 | 11.229 | 10.688 |
| 3.939999999999791 | 15.274 | 11.25 | 10.716 |
| 3.949999999999791 | 15.288 | 11.27 | 10.744 |
| 3.959999999999791 | 15.303 | 11.291 | 10.772 |
| 3.969999999999791 | 15.318 | 11.311 | 10.801 |
| 3.97999999999979 | 15.332 | 11.332 | 10.829 |
| 3.98999999999979 | 15.347 | 11.353 | 10.857 |
| 3.99999999999979 | 15.361 | 11.373 | 10.886 |
| 4.00999999999979 | 15.376 | 11.394 | 10.915 |
| 4.01999999999979 | 15.391 | 11.415 | 10.943 |
| 4.02999999999979 | 15.405 | 11.436 | 10.972 |
| 4.03999999999979 | 15.42 | 11.457 | 11.001 |
| 4.04999999999979 | 15.435 | 11.477 | 11.03 |
| 4.05999999999979 | 15.45 | 11.498 | 11.059 |
| 4.069999999999789 | 15.464 | 11.519 | 11.088 |
| 4.079999999999788 | 15.479 | 11.54 | 11.117 |
| 4.089999999999788 | 15.494 | 11.561 | 11.146 |
| 4.099999999999788 | 15.509 | 11.583 | 11.175 |
| 4.109999999999788 | 15.523 | 11.604 | 11.205 |
| 4.119999999999788 | 15.538 | 11.625 | 11.234 |
| 4.129999999999788 | 15.553 | 11.646 | 11.264 |
| 4.139999999999787 | 15.568 | 11.667 | 11.293 |
| 4.149999999999787 | 15.583 | 11.689 | 11.323 |
| 4.159999999999787 | 15.597 | 11.71 | 11.353 |
| 4.169999999999787 | 15.612 | 11.731 | 11.383 |
| 4.179999999999786 | 15.627 | 11.753 | 11.412 |
| 4.189999999999786 | 15.642 | 11.774 | 11.442 |
| 4.199999999999786 | 15.657 | 11.796 | 11.472 |
| 4.209999999999785 | 15.672 | 11.817 | 11.503 |
| 4.219999999999785 | 15.687 | 11.839 | 11.533 |
| 4.229999999999785 | 15.702 | 11.86 | 11.563 |
| 4.239999999999785 | 15.717 | 11.882 | 11.594 |
| 4.249999999999785 | 15.732 | 11.904 | 11.624 |
| 4.259999999999784 | 15.747 | 11.925 | 11.655 |
| 4.269999999999784 | 15.762 | 11.947 | 11.685 |
| 4.279999999999784 | 15.777 | 11.969 | 11.716 |
| 4.289999999999784 | 15.792 | 11.991 | 11.747 |
| 4.299999999999784 | 15.807 | 12.013 | 11.777 |
| 4.309999999999784 | 15.822 | 12.035 | 11.808 |
| 4.319999999999784 | 15.837 | 12.057 | 11.839 |
| 4.329999999999783 | 15.852 | 12.079 | 11.871 |
| 4.339999999999783 | 15.867 | 12.101 | 11.902 |
| 4.349999999999783 | 15.883 | 12.123 | 11.933 |
| 4.359999999999783 | 15.898 | 12.145 | 11.964 |
| 4.369999999999782 | 15.913 | 12.167 | 11.996 |
| 4.379999999999782 | 15.928 | 12.189 | 12.027 |
| 4.389999999999782 | 15.943 | 12.211 | 12.059 |
| 4.399999999999782 | 15.958 | 12.234 | 12.091 |
| 4.409999999999781 | 15.974 | 12.256 | 12.122 |
| 4.419999999999781 | 15.989 | 12.278 | 12.154 |
| 4.429999999999781 | 16.004 | 12.301 | 12.186 |
| 4.43999999999978 | 16.019 | 12.323 | 12.218 |
| 4.44999999999978 | 16.035 | 12.346 | 12.25 |
| 4.45999999999978 | 16.05 | 12.368 | 12.282 |
| 4.46999999999978 | 16.065 | 12.391 | 12.315 |
| 4.47999999999978 | 16.081 | 12.413 | 12.347 |
| 4.48999999999978 | 16.096 | 12.436 | 12.379 |
| 4.49999999999978 | 16.111 | 12.459 | 12.412 |
| 4.50999999999978 | 16.127 | 12.482 | 12.445 |
| 4.51999999999978 | 16.142 | 12.504 | 12.477 |
| 4.52999999999978 | 16.157 | 12.527 | 12.51 |
| 4.539999999999778 | 16.173 | 12.55 | 12.543 |
| 4.549999999999778 | 16.188 | 12.573 | 12.576 |
| 4.559999999999778 | 16.204 | 12.596 | 12.609 |
| 4.569999999999778 | 16.219 | 12.619 | 12.642 |
| 4.579999999999778 | 16.235 | 12.642 | 12.675 |
| 4.589999999999777 | 16.25 | 12.665 | 12.709 |
| 4.599999999999777 | 16.265 | 12.688 | 12.742 |
| 4.609999999999777 | 16.281 | 12.711 | 12.775 |
| 4.619999999999777 | 16.297 | 12.734 | 12.809 |
| 4.629999999999777 | 16.312 | 12.758 | 12.843 |
| 4.639999999999776 | 16.328 | 12.781 | 12.876 |
| 4.649999999999776 | 16.343 | 12.804 | 12.91 |
| 4.659999999999776 | 16.359 | 12.828 | 12.944 |
| 4.669999999999776 | 16.374 | 12.851 | 12.978 |
| 4.679999999999775 | 16.39 | 12.874 | 13.012 |
| 4.689999999999775 | 16.406 | 12.898 | 13.046 |
| 4.699999999999775 | 16.421 | 12.922 | 13.081 |
| 4.709999999999775 | 16.437 | 12.945 | 13.115 |
| 4.719999999999774 | 16.453 | 12.969 | 13.149 |
| 4.729999999999774 | 16.468 | 12.992 | 13.184 |
| 4.739999999999774 | 16.484 | 13.016 | 13.219 |
| 4.749999999999774 | 16.5 | 13.04 | 13.253 |
| 4.759999999999774 | 16.515 | 13.064 | 13.288 |
| 4.769999999999774 | 16.531 | 13.087 | 13.323 |
| 4.779999999999773 | 16.547 | 13.111 | 13.358 |
| 4.789999999999773 | 16.563 | 13.135 | 13.393 |
| 4.799999999999773 | 16.579 | 13.159 | 13.428 |
| 4.809999999999773 | 16.594 | 13.183 | 13.464 |
| 4.819999999999773 | 16.61 | 13.207 | 13.499 |
| 4.829999999999773 | 16.626 | 13.231 | 13.534 |
| 4.839999999999772 | 16.642 | 13.256 | 13.57 |
| 4.849999999999772 | 16.658 | 13.28 | 13.606 |
| 4.859999999999772 | 16.674 | 13.304 | 13.641 |
| 4.869999999999772 | 16.689 | 13.328 | 13.677 |
| 4.879999999999771 | 16.705 | 13.353 | 13.713 |
| 4.889999999999771 | 16.721 | 13.377 | 13.749 |
| 4.899999999999771 | 16.737 | 13.401 | 13.785 |
| 4.90999999999977 | 16.753 | 13.426 | 13.822 |
| 4.91999999999977 | 16.769 | 13.45 | 13.858 |
| 4.92999999999977 | 16.785 | 13.475 | 13.894 |
| 4.93999999999977 | 16.801 | 13.499 | 13.931 |
| 4.94999999999977 | 16.817 | 13.524 | 13.967 |
| 4.95999999999977 | 16.833 | 13.549 | 14.004 |
| 4.96999999999977 | 16.849 | 13.574 | 14.041 |
| 4.97999999999977 | 16.865 | 13.598 | 14.078 |
| 4.98999999999977 | 16.881 | 13.623 | 14.115 |
| 4.99999999999977 | 16.898 | 13.648 | 14.152 |
| 5.009999999999768 | 16.914 | 13.673 | 14.189 |
| 5.019999999999768 | 16.93 | 13.698 | 14.226 |
| 5.029999999999768 | 16.946 | 13.723 | 14.264 |
| 5.039999999999768 | 16.962 | 13.748 | 14.301 |
| 5.049999999999767 | 16.978 | 13.773 | 14.339 |
| 5.059999999999767 | 16.994 | 13.798 | 14.376 |
| 5.069999999999767 | 17.011 | 13.823 | 14.414 |
| 5.079999999999767 | 17.027 | 13.848 | 14.452 |
| 5.089999999999767 | 17.043 | 13.874 | 14.49 |
| 5.099999999999766 | 17.059 | 13.899 | 14.528 |
| 5.109999999999766 | 17.076 | 13.924 | 14.566 |
| 5.119999999999766 | 17.092 | 13.95 | 14.604 |
| 5.129999999999766 | 17.108 | 13.975 | 14.643 |
| 5.139999999999766 | 17.125 | 14.001 | 14.681 |
| 5.149999999999765 | 17.141 | 14.026 | 14.72 |
| 5.159999999999765 | 17.157 | 14.052 | 14.759 |
| 5.169999999999765 | 17.174 | 14.078 | 14.797 |
| 5.179999999999765 | 17.19 | 14.103 | 14.836 |
| 5.189999999999764 | 17.206 | 14.129 | 14.875 |
| 5.199999999999764 | 17.223 | 14.155 | 14.914 |
| 5.209999999999764 | 17.239 | 14.181 | 14.953 |
| 5.219999999999764 | 17.256 | 14.207 | 14.993 |
| 5.229999999999764 | 17.272 | 14.232 | 15.032 |
| 5.239999999999763 | 17.289 | 14.258 | 15.072 |
| 5.249999999999763 | 17.305 | 14.284 | 15.111 |
| 5.259999999999763 | 17.322 | 14.311 | 15.151 |
| 5.269999999999763 | 17.338 | 14.337 | 15.191 |
| 5.279999999999763 | 17.355 | 14.363 | 15.231 |
| 5.289999999999762 | 17.371 | 14.389 | 15.271 |
| 5.299999999999762 | 17.388 | 14.415 | 15.311 |
| 5.309999999999762 | 17.404 | 14.442 | 15.351 |
| 5.319999999999762 | 17.421 | 14.468 | 15.391 |
| 5.329999999999762 | 17.437 | 14.494 | 15.432 |
| 5.339999999999761 | 17.454 | 14.521 | 15.472 |
| 5.349999999999761 | 17.471 | 14.547 | 15.513 |
| 5.359999999999761 | 17.487 | 14.574 | 15.554 |
| 5.369999999999761 | 17.504 | 14.6 | 15.594 |
| 5.37999999999976 | 17.521 | 14.627 | 15.635 |
| 5.38999999999976 | 17.537 | 14.654 | 15.677 |
| 5.39999999999976 | 17.554 | 14.68 | 15.718 |
| 5.40999999999976 | 17.571 | 14.707 | 15.759 |
| 5.41999999999976 | 17.588 | 14.734 | 15.8 |
| 5.42999999999976 | 17.604 | 14.761 | 15.842 |
| 5.43999999999976 | 17.621 | 14.788 | 15.884 |
| 5.44999999999976 | 17.638 | 14.815 | 15.925 |
| 5.45999999999976 | 17.655 | 14.842 | 15.967 |
| 5.46999999999976 | 17.672 | 14.869 | 16.009 |
| 5.479999999999758 | 17.689 | 14.896 | 16.051 |
| 5.489999999999758 | 17.705 | 14.923 | 16.093 |
| 5.499999999999758 | 17.722 | 14.951 | 16.136 |
| 5.509999999999758 | 17.739 | 14.978 | 16.178 |
| 5.519999999999758 | 17.756 | 15.005 | 16.22 |
| 5.529999999999758 | 17.773 | 15.033 | 16.263 |
| 5.539999999999757 | 17.79 | 15.06 | 16.306 |
| 5.549999999999757 | 17.807 | 15.088 | 16.349 |
| 5.559999999999757 | 17.824 | 15.115 | 16.392 |
| 5.569999999999757 | 17.841 | 15.143 | 16.435 |
| 5.579999999999756 | 17.858 | 15.17 | 16.478 |
| 5.589999999999756 | 17.875 | 15.198 | 16.521 |
| 5.599999999999756 | 17.892 | 15.226 | 16.564 |
| 5.609999999999756 | 17.909 | 15.253 | 16.608 |
| 5.619999999999756 | 17.926 | 15.281 | 16.652 |
| 5.629999999999756 | 17.943 | 15.309 | 16.695 |
| 5.639999999999755 | 17.96 | 15.337 | 16.739 |
| 5.649999999999755 | 17.978 | 15.365 | 16.783 |
| 5.659999999999755 | 17.995 | 15.393 | 16.827 |
| 5.669999999999755 | 18.012 | 15.421 | 16.872 |
| 5.679999999999754 | 18.029 | 15.449 | 16.916 |
| 5.689999999999754 | 18.046 | 15.478 | 16.96 |
| 5.699999999999754 | 18.063 | 15.506 | 17.005 |
| 5.709999999999754 | 18.081 | 15.534 | 17.05 |
| 5.719999999999754 | 18.098 | 15.562 | 17.094 |
| 5.729999999999753 | 18.115 | 15.591 | 17.139 |
| 5.739999999999753 | 18.132 | 15.619 | 17.184 |
| 5.749999999999753 | 18.15 | 15.648 | 17.229 |
| 5.759999999999753 | 18.167 | 15.676 | 17.275 |
| 5.769999999999753 | 18.184 | 15.705 | 17.32 |
| 5.779999999999752 | 18.202 | 15.734 | 17.366 |
| 5.789999999999752 | 18.219 | 15.762 | 17.411 |
| 5.799999999999752 | 18.236 | 15.791 | 17.457 |
| 5.809999999999752 | 18.254 | 15.82 | 17.503 |
| 5.819999999999752 | 18.271 | 15.849 | 17.549 |
| 5.829999999999751 | 18.289 | 15.878 | 17.595 |
| 5.839999999999751 | 18.306 | 15.907 | 17.641 |
| 5.849999999999751 | 18.323 | 15.936 | 17.687 |
| 5.859999999999751 | 18.341 | 15.965 | 17.734 |
| 5.86999999999975 | 18.358 | 15.994 | 17.78 |
| 5.87999999999975 | 18.376 | 16.023 | 17.827 |
| 5.88999999999975 | 18.393 | 16.052 | 17.874 |
| 5.89999999999975 | 18.411 | 16.082 | 17.921 |
| 5.90999999999975 | 18.429 | 16.111 | 17.968 |
| 5.91999999999975 | 18.446 | 16.14 | 18.015 |
| 5.92999999999975 | 18.464 | 16.17 | 18.063 |
| 5.93999999999975 | 18.481 | 16.199 | 18.11 |
| 5.949999999999748 | 18.499 | 16.229 | 18.158 |
| 5.959999999999748 | 18.517 | 16.259 | 18.205 |
| 5.969999999999748 | 18.534 | 16.288 | 18.253 |
| 5.979999999999748 | 18.552 | 16.318 | 18.301 |
| 5.989999999999747 | 18.57 | 16.348 | 18.349 |
| 5.999999999999747 | 18.587 | 16.378 | 18.397 |
| 6.009999999999747 | 18.605 | 16.407 | 18.446 |
| 6.019999999999747 | 18.623 | 16.437 | 18.494 |
| 6.029999999999747 | 18.641 | 16.467 | 18.543 |
| 6.039999999999746 | 18.658 | 16.497 | 18.591 |
| 6.049999999999746 | 18.676 | 16.528 | 18.64 |
| 6.059999999999746 | 18.694 | 16.558 | 18.689 |
| 6.069999999999746 | 18.712 | 16.588 | 18.738 |
| 6.079999999999746 | 18.73 | 16.618 | 18.788 |
| 6.089999999999745 | 18.747 | 16.649 | 18.837 |
| 6.099999999999745 | 18.765 | 16.679 | 18.886 |
| 6.109999999999745 | 18.783 | 16.709 | 18.936 |
| 6.119999999999745 | 18.801 | 16.74 | 18.986 |
| 6.129999999999745 | 18.819 | 16.77 | 19.036 |
| 6.139999999999744 | 18.837 | 16.801 | 19.086 |
| 6.149999999999744 | 18.855 | 16.832 | 19.136 |
| 6.159999999999744 | 18.873 | 16.862 | 19.186 |
| 6.169999999999744 | 18.891 | 16.893 | 19.236 |
| 6.179999999999744 | 18.909 | 16.924 | 19.287 |
| 6.189999999999744 | 18.927 | 16.955 | 19.338 |
| 6.199999999999743 | 18.945 | 16.986 | 19.388 |
| 6.209999999999743 | 18.963 | 17.017 | 19.439 |
| 6.219999999999743 | 18.981 | 17.048 | 19.49 |
| 6.229999999999743 | 18.999 | 17.079 | 19.542 |
| 6.239999999999742 | 19.017 | 17.11 | 19.593 |
| 6.249999999999742 | 19.036 | 17.141 | 19.645 |
| 6.259999999999742 | 19.054 | 17.173 | 19.696 |
| 6.269999999999742 | 19.072 | 17.204 | 19.748 |
| 6.279999999999741 | 19.09 | 17.235 | 19.8 |
| 6.289999999999741 | 19.108 | 17.267 | 19.852 |
| 6.299999999999741 | 19.126 | 17.298 | 19.904 |
| 6.309999999999741 | 19.145 | 17.33 | 19.956 |
| 6.319999999999741 | 19.163 | 17.362 | 20.009 |
| 6.329999999999741 | 19.181 | 17.393 | 20.061 |
| 6.33999999999974 | 19.2 | 17.425 | 20.114 |
| 6.34999999999974 | 19.218 | 17.457 | 20.167 |
| 6.35999999999974 | 19.236 | 17.489 | 20.22 |
| 6.36999999999974 | 19.254 | 17.521 | 20.273 |
| 6.37999999999974 | 19.273 | 17.552 | 20.326 |
| 6.38999999999974 | 19.291 | 17.585 | 20.379 |
| 6.39999999999974 | 19.31 | 17.617 | 20.433 |
| 6.409999999999738 | 19.328 | 17.649 | 20.487 |
| 6.419999999999738 | 19.346 | 17.681 | 20.541 |
| 6.429999999999738 | 19.365 | 17.713 | 20.594 |
| 6.439999999999738 | 19.383 | 17.746 | 20.649 |
| 6.449999999999738 | 19.402 | 17.778 | 20.703 |
| 6.459999999999737 | 19.42 | 17.81 | 20.757 |
| 6.469999999999737 | 19.439 | 17.843 | 20.812 |
| 6.479999999999737 | 19.457 | 17.875 | 20.866 |
| 6.489999999999737 | 19.476 | 17.908 | 20.921 |
| 6.499999999999737 | 19.495 | 17.941 | 20.976 |
| 6.509999999999736 | 19.513 | 17.973 | 21.031 |
| 6.519999999999736 | 19.532 | 18.006 | 21.087 |
| 6.529999999999736 | 19.55 | 18.039 | 21.142 |
| 6.539999999999736 | 19.569 | 18.072 | 21.198 |
| 6.549999999999736 | 19.588 | 18.105 | 21.253 |
| 6.559999999999735 | 19.606 | 18.138 | 21.309 |
| 6.569999999999735 | 19.625 | 18.171 | 21.365 |
| 6.579999999999735 | 19.644 | 18.204 | 21.421 |
| 6.589999999999735 | 19.662 | 18.238 | 21.477 |
| 6.599999999999734 | 19.681 | 18.271 | 21.534 |
| 6.609999999999734 | 19.7 | 18.304 | 21.59 |
| 6.619999999999734 | 19.719 | 18.338 | 21.647 |
| 6.629999999999734 | 19.738 | 18.371 | 21.704 |
| 6.639999999999734 | 19.756 | 18.405 | 21.761 |
| 6.649999999999734 | 19.775 | 18.438 | 21.818 |
| 6.659999999999734 | 19.794 | 18.472 | 21.876 |
| 6.669999999999733 | 19.813 | 18.506 | 21.933 |
| 6.679999999999733 | 19.832 | 18.539 | 21.991 |
| 6.689999999999733 | 19.851 | 18.573 | 22.048 |
| 6.699999999999733 | 19.87 | 18.607 | 22.106 |
| 6.709999999999732 | 19.889 | 18.641 | 22.164 |
| 6.719999999999732 | 19.908 | 18.675 | 22.223 |
| 6.729999999999732 | 19.927 | 18.709 | 22.281 |
| 6.739999999999731 | 19.946 | 18.743 | 22.34 |
| 6.749999999999731 | 19.965 | 18.777 | 22.398 |
| 6.759999999999731 | 19.984 | 18.812 | 22.457 |
| 6.769999999999731 | 20.003 | 18.846 | 22.516 |
| 6.77999999999973 | 20.022 | 18.88 | 22.575 |
| 6.78999999999973 | 20.041 | 18.915 | 22.634 |
| 6.79999999999973 | 20.06 | 18.949 | 22.694 |
| 6.80999999999973 | 20.079 | 18.984 | 22.754 |
| 6.81999999999973 | 20.098 | 19.019 | 22.813 |
| 6.82999999999973 | 20.117 | 19.053 | 22.873 |
| 6.83999999999973 | 20.137 | 19.088 | 22.933 |
| 6.84999999999973 | 20.156 | 19.123 | 22.994 |
| 6.85999999999973 | 20.175 | 19.158 | 23.054 |
| 6.86999999999973 | 20.194 | 19.193 | 23.115 |
| 6.879999999999728 | 20.214 | 19.228 | 23.175 |
| 6.889999999999728 | 20.233 | 19.263 | 23.236 |
| 6.899999999999728 | 20.252 | 19.298 | 23.297 |
| 6.909999999999728 | 20.271 | 19.333 | 23.358 |
| 6.919999999999728 | 20.291 | 19.369 | 23.42 |
| 6.929999999999727 | 20.31 | 19.404 | 23.481 |
| 6.939999999999727 | 20.329 | 19.439 | 23.543 |
| 6.949999999999727 | 20.349 | 19.475 | 23.605 |
| 6.959999999999727 | 20.368 | 19.51 | 23.667 |
| 6.969999999999727 | 20.388 | 19.546 | 23.729 |
| 6.979999999999726 | 20.407 | 19.582 | 23.791 |
| 6.989999999999726 | 20.427 | 19.617 | 23.854 |
| 6.999999999999726 | 20.446 | 19.653 | 23.917 |
| 7.009999999999726 | 20.466 | 19.689 | 23.979 |
| 7.019999999999726 | 20.485 | 19.725 | 24.042 |
| 7.029999999999725 | 20.505 | 19.761 | 24.106 |
| 7.039999999999725 | 20.524 | 19.797 | 24.169 |
| 7.049999999999725 | 20.544 | 19.833 | 24.232 |
| 7.059999999999725 | 20.563 | 19.869 | 24.296 |
| 7.069999999999724 | 20.583 | 19.906 | 24.36 |
| 7.079999999999724 | 20.603 | 19.942 | 24.424 |
| 7.089999999999724 | 20.622 | 19.978 | 24.488 |
| 7.099999999999724 | 20.642 | 20.015 | 24.552 |
| 7.109999999999724 | 20.662 | 20.051 | 24.617 |
| 7.119999999999724 | 20.681 | 20.088 | 24.682 |
| 7.129999999999724 | 20.701 | 20.124 | 24.746 |
| 7.139999999999723 | 20.721 | 20.161 | 24.811 |
| 7.149999999999723 | 20.74 | 20.198 | 24.877 |
| 7.159999999999723 | 20.76 | 20.235 | 24.942 |
| 7.169999999999723 | 20.78 | 20.272 | 25.007 |
| 7.179999999999722 | 20.8 | 20.309 | 25.073 |
| 7.189999999999722 | 20.82 | 20.346 | 25.139 |
| 7.199999999999722 | 20.84 | 20.383 | 25.205 |
| 7.209999999999721 | 20.859 | 20.42 | 25.271 |
| 7.219999999999721 | 20.879 | 20.457 | 25.338 |
| 7.229999999999721 | 20.899 | 20.495 | 25.404 |
| 7.23999999999972 | 20.919 | 20.532 | 25.471 |
| 7.24999999999972 | 20.939 | 20.57 | 25.538 |
| 7.25999999999972 | 20.959 | 20.607 | 25.605 |
| 7.26999999999972 | 20.979 | 20.645 | 25.672 |
| 7.27999999999972 | 20.999 | 20.682 | 25.74 |
| 7.28999999999972 | 21.019 | 20.72 | 25.807 |
| 7.29999999999972 | 21.039 | 20.758 | 25.875 |
| 7.30999999999972 | 21.059 | 20.796 | 25.943 |
| 7.31999999999972 | 21.079 | 20.834 | 26.011 |
| 7.329999999999719 | 21.099 | 20.872 | 26.08 |
| 7.33999999999972 | 21.119 | 20.91 | 26.148 |
| 7.349999999999719 | 21.14 | 20.948 | 26.217 |
| 7.359999999999719 | 21.16 | 20.986 | 26.286 |
| 7.369999999999718 | 21.18 | 21.025 | 26.355 |
| 7.379999999999718 | 21.2 | 21.063 | 26.424 |
| 7.389999999999718 | 21.22 | 21.101 | 26.493 |
| 7.399999999999718 | 21.241 | 21.14 | 26.563 |
| 7.409999999999717 | 21.261 | 21.178 | 26.633 |
| 7.419999999999717 | 21.281 | 21.217 | 26.703 |
| 7.429999999999717 | 21.301 | 21.256 | 26.773 |
| 7.439999999999717 | 21.322 | 21.295 | 26.843 |
| 7.449999999999716 | 21.342 | 21.334 | 26.914 |
| 7.459999999999716 | 21.362 | 21.372 | 26.984 |
| 7.469999999999716 | 21.383 | 21.411 | 27.055 |
| 7.479999999999716 | 21.403 | 21.451 | 27.126 |
| 7.489999999999715 | 21.424 | 21.49 | 27.198 |
| 7.499999999999715 | 21.444 | 21.529 | 27.269 |
| 7.509999999999715 | 21.464 | 21.568 | 27.341 |
| 7.519999999999715 | 21.485 | 21.608 | 27.413 |
| 7.529999999999715 | 21.505 | 21.647 | 27.485 |
| 7.539999999999714 | 21.526 | 21.686 | 27.557 |
| 7.549999999999714 | 21.546 | 21.726 | 27.629 |
| 7.559999999999714 | 21.567 | 21.766 | 27.702 |
| 7.569999999999714 | 21.588 | 21.805 | 27.775 |
| 7.579999999999714 | 21.608 | 21.845 | 27.847 |
| 7.589999999999714 | 21.629 | 21.885 | 27.921 |
| 7.599999999999714 | 21.649 | 21.925 | 27.994 |
| 7.609999999999713 | 21.67 | 21.965 | 28.068 |
| 7.619999999999713 | 21.691 | 22.005 | 28.141 |
| 7.629999999999713 | 21.711 | 22.045 | 28.215 |
| 7.639999999999713 | 21.732 | 22.085 | 28.289 |
| 7.649999999999712 | 21.753 | 22.126 | 28.364 |
| 7.659999999999712 | 21.774 | 22.166 | 28.438 |
| 7.669999999999712 | 21.794 | 22.207 | 28.513 |
| 7.679999999999712 | 21.815 | 22.247 | 28.588 |
| 7.689999999999712 | 21.836 | 22.288 | 28.663 |
| 7.699999999999711 | 21.857 | 22.328 | 28.738 |
| 7.709999999999711 | 21.878 | 22.369 | 28.814 |
| 7.719999999999711 | 21.898 | 22.41 | 28.889 |
| 7.729999999999711 | 21.919 | 22.451 | 28.965 |
| 7.73999999999971 | 21.94 | 22.492 | 29.041 |
| 7.74999999999971 | 21.961 | 22.533 | 29.118 |
| 7.75999999999971 | 21.982 | 22.574 | 29.194 |
| 7.76999999999971 | 22.003 | 22.615 | 29.271 |
| 7.77999999999971 | 22.024 | 22.656 | 29.348 |
| 7.78999999999971 | 22.045 | 22.698 | 29.425 |
| 7.79999999999971 | 22.066 | 22.739 | 29.502 |
| 7.80999999999971 | 22.087 | 22.781 | 29.58 |
| 7.819999999999709 | 22.108 | 22.822 | 29.657 |
| 7.829999999999709 | 22.129 | 22.864 | 29.735 |
| 7.839999999999708 | 22.15 | 22.906 | 29.813 |
| 7.849999999999708 | 22.171 | 22.947 | 29.892 |
| 7.859999999999708 | 22.193 | 22.989 | 29.97 |
| 7.869999999999708 | 22.214 | 23.031 | 30.049 |
| 7.879999999999707 | 22.235 | 23.073 | 30.128 |
| 7.889999999999707 | 22.256 | 23.115 | 30.207 |
| 7.899999999999707 | 22.277 | 23.158 | 30.286 |
| 7.909999999999707 | 22.299 | 23.2 | 30.366 |
| 7.919999999999706 | 22.32 | 23.242 | 30.446 |
| 7.929999999999706 | 22.341 | 23.285 | 30.526 |
| 7.939999999999706 | 22.362 | 23.327 | 30.606 |
| 7.949999999999706 | 22.384 | 23.37 | 30.686 |
| 7.959999999999705 | 22.405 | 23.412 | 30.767 |
| 7.969999999999705 | 22.426 | 23.455 | 30.848 |
| 7.979999999999705 | 22.448 | 23.498 | 30.929 |
| 7.989999999999705 | 22.469 | 23.541 | 31.01 |
| 7.999999999999705 | 22.491 | 23.584 | 31.092 |
| 8.009999999999703 | 22.512 | 23.627 | 31.173 |
| 8.019999999999705 | 22.534 | 23.67 | 31.255 |
| 8.029999999999704 | 22.555 | 23.713 | 31.337 |
| 8.039999999999704 | 22.577 | 23.756 | 31.42 |
| 8.049999999999704 | 22.598 | 23.8 | 31.502 |
| 8.059999999999704 | 22.62 | 23.843 | 31.585 |
| 8.069999999999704 | 22.641 | 23.887 | 31.668 |
| 8.079999999999703 | 22.663 | 23.93 | 31.751 |
| 8.089999999999703 | 22.684 | 23.974 | 31.834 |
| 8.099999999999701 | 22.706 | 24.018 | 31.918 |
| 8.109999999999703 | 22.728 | 24.061 | 32.002 |
| 8.119999999999703 | 22.749 | 24.105 | 32.086 |
| 8.129999999999702 | 22.771 | 24.149 | 32.17 |
| 8.139999999999702 | 22.793 | 24.193 | 32.255 |
| 8.1499999999997 | 22.815 | 24.238 | 32.34 |
| 8.1599999999997 | 22.836 | 24.282 | 32.424 |
| 8.1699999999997 | 22.858 | 24.326 | 32.51 |
| 8.1799999999997 | 22.88 | 24.371 | 32.595 |
| 8.1899999999997 | 22.902 | 24.415 | 32.681 |
| 8.1999999999997 | 22.923 | 24.46 | 32.767 |
| 8.2099999999997 | 22.945 | 24.504 | 32.853 |
| 8.2199999999997 | 22.967 | 24.549 | 32.939 |
| 8.2299999999997 | 22.989 | 24.594 | 33.025 |
| 8.2399999999997 | 23.011 | 24.639 | 33.112 |
| 8.2499999999997 | 23.033 | 24.684 | 33.199 |
| 8.2599999999997 | 23.055 | 24.729 | 33.286 |
| 8.2699999999997 | 23.077 | 24.774 | 33.374 |
| 8.2799999999997 | 23.099 | 24.819 | 33.462 |
| 8.289999999999697 | 23.121 | 24.864 | 33.549 |
| 8.299999999999699 | 23.143 | 24.91 | 33.638 |
| 8.309999999999699 | 23.165 | 24.955 | 33.726 |
| 8.319999999999698 | 23.187 | 25.001 | 33.815 |
| 8.329999999999698 | 23.209 | 25.046 | 33.903 |
| 8.339999999999698 | 23.231 | 25.092 | 33.992 |
| 8.349999999999698 | 23.254 | 25.138 | 34.082 |
| 8.359999999999697 | 23.276 | 25.184 | 34.171 |
| 8.369999999999697 | 23.298 | 25.23 | 34.261 |
| 8.379999999999695 | 23.32 | 25.276 | 34.351 |
| 8.389999999999697 | 23.342 | 25.322 | 34.441 |
| 8.399999999999697 | 23.365 | 25.368 | 34.532 |
| 8.409999999999696 | 23.387 | 25.414 | 34.623 |
| 8.419999999999696 | 23.409 | 25.461 | 34.713 |
| 8.429999999999694 | 23.432 | 25.507 | 34.805 |
| 8.439999999999696 | 23.454 | 25.554 | 34.896 |
| 8.449999999999696 | 23.476 | 25.6 | 34.988 |
| 8.459999999999695 | 23.499 | 25.647 | 35.08 |
| 8.469999999999695 | 23.521 | 25.694 | 35.172 |
| 8.479999999999693 | 23.543 | 25.741 | 35.264 |
| 8.489999999999695 | 23.566 | 25.788 | 35.357 |
| 8.499999999999694 | 23.588 | 25.835 | 35.45 |
| 8.509999999999694 | 23.611 | 25.882 | 35.543 |
| 8.519999999999694 | 23.633 | 25.929 | 35.636 |
| 8.529999999999694 | 23.656 | 25.976 | 35.73 |
| 8.539999999999694 | 23.679 | 26.024 | 35.824 |
| 8.549999999999693 | 23.701 | 26.071 | 35.918 |
| 8.55999999999969 | 23.724 | 26.119 | 36.012 |
| 8.56999999999969 | 23.746 | 26.166 | 36.107 |
| 8.57999999999969 | 23.769 | 26.214 | 36.202 |
| 8.58999999999969 | 23.792 | 26.262 | 36.297 |
| 8.59999999999969 | 23.814 | 26.31 | 36.392 |
| 8.60999999999969 | 23.837 | 26.358 | 36.488 |
| 8.61999999999969 | 23.86 | 26.406 | 36.584 |
| 8.62999999999969 | 23.882 | 26.454 | 36.68 |
| 8.63999999999969 | 23.905 | 26.503 | 36.776 |
| 8.64999999999969 | 23.928 | 26.551 | 36.873 |
| 8.65999999999969 | 23.951 | 26.599 | 36.97 |
| 8.66999999999969 | 23.974 | 26.648 | 37.067 |
| 8.67999999999969 | 23.997 | 26.697 | 37.164 |
| 8.68999999999969 | 24.019 | 26.745 | 37.262 |
| 8.69999999999969 | 24.042 | 26.794 | 37.36 |
| 8.70999999999969 | 24.065 | 26.843 | 37.458 |
| 8.71999999999969 | 24.088 | 26.892 | 37.556 |
| 8.72999999999969 | 24.111 | 26.941 | 37.655 |
| 8.73999999999969 | 24.134 | 26.99 | 37.754 |
| 8.74999999999969 | 24.157 | 27.039 | 37.853 |
| 8.759999999999687 | 24.18 | 27.089 | 37.952 |
| 8.769999999999689 | 24.203 | 27.138 | 38.052 |
| 8.779999999999688 | 24.226 | 27.188 | 38.152 |
| 8.789999999999688 | 24.249 | 27.237 | 38.252 |
| 8.799999999999686 | 24.273 | 27.287 | 38.353 |
| 8.809999999999688 | 24.296 | 27.337 | 38.454 |
| 8.819999999999688 | 24.319 | 27.387 | 38.555 |
| 8.829999999999687 | 24.342 | 27.437 | 38.656 |
| 8.839999999999687 | 24.365 | 27.487 | 38.757 |
| 8.849999999999685 | 24.389 | 27.537 | 38.859 |
| 8.859999999999687 | 24.412 | 27.587 | 38.961 |
| 8.869999999999687 | 24.435 | 27.638 | 39.064 |
| 8.879999999999686 | 24.458 | 27.688 | 39.166 |
| 8.889999999999686 | 24.482 | 27.739 | 39.269 |
| 8.899999999999684 | 24.505 | 27.789 | 39.372 |
| 8.909999999999686 | 24.528 | 27.84 | 39.476 |
| 8.919999999999686 | 24.552 | 27.891 | 39.579 |
| 8.929999999999685 | 24.575 | 27.942 | 39.683 |
| 8.939999999999685 | 24.599 | 27.993 | 39.788 |
| 8.949999999999685 | 24.622 | 28.044 | 39.892 |
| 8.959999999999685 | 24.646 | 28.095 | 39.997 |
| 8.969999999999684 | 24.669 | 28.146 | 40.102 |
| 8.979999999999684 | 24.693 | 28.197 | 40.207 |
| 8.989999999999682 | 24.716 | 28.249 | 40.313 |
| 8.999999999999684 | 24.74 | 28.3 | 40.419 |
| 9.009999999999684 | 24.763 | 28.352 | 40.525 |
| 9.019999999999683 | 24.787 | 28.404 | 40.632 |
| 9.029999999999683 | 24.811 | 28.456 | 40.738 |
| 9.039999999999681 | 24.834 | 28.508 | 40.845 |
| 9.049999999999683 | 24.858 | 28.56 | 40.953 |
| 9.05999999999968 | 24.882 | 28.612 | 41.06 |
| 9.06999999999968 | 24.905 | 28.664 | 41.168 |
| 9.07999999999968 | 24.929 | 28.716 | 41.276 |
| 9.08999999999968 | 24.953 | 28.769 | 41.385 |
| 9.09999999999968 | 24.977 | 28.821 | 41.493 |
| 9.10999999999968 | 25 | 28.874 | 41.602 |
| 9.11999999999968 | 25.024 | 28.926 | 41.712 |
| 9.12999999999968 | 25.048 | 28.979 | 41.821 |
| 9.13999999999968 | 25.072 | 29.032 | 41.931 |
| 9.14999999999968 | 25.096 | 29.085 | 42.041 |
| 9.15999999999968 | 25.12 | 29.138 | 42.152 |
| 9.16999999999968 | 25.144 | 29.191 | 42.263 |
| 9.17999999999968 | 25.168 | 29.245 | 42.374 |
| 9.18999999999968 | 25.192 | 29.298 | 42.485 |
| 9.19999999999968 | 25.216 | 29.351 | 42.597 |
| 9.20999999999968 | 25.24 | 29.405 | 42.708 |
| 9.21999999999968 | 25.264 | 29.459 | 42.821 |
| 9.229999999999677 | 25.288 | 29.512 | 42.933 |
| 9.239999999999679 | 25.312 | 29.566 | 43.046 |
| 9.249999999999678 | 25.336 | 29.62 | 43.159 |
| 9.259999999999678 | 25.36 | 29.674 | 43.272 |
| 9.269999999999678 | 25.385 | 29.728 | 43.386 |
| 9.279999999999678 | 25.409 | 29.783 | 43.5 |
| 9.289999999999678 | 25.433 | 29.837 | 43.614 |
| 9.299999999999677 | 25.457 | 29.891 | 43.729 |
| 9.309999999999677 | 25.482 | 29.946 | 43.844 |
| 9.319999999999675 | 25.506 | 30.001 | 43.959 |
| 9.329999999999677 | 25.53 | 30.055 | 44.074 |
| 9.339999999999677 | 25.555 | 30.11 | 44.19 |
| 9.349999999999676 | 25.579 | 30.165 | 44.306 |
| 9.359999999999676 | 25.603 | 30.22 | 44.423 |
| 9.369999999999674 | 25.628 | 30.275 | 44.539 |
| 9.379999999999676 | 25.652 | 30.331 | 44.656 |
| 9.389999999999675 | 25.677 | 30.386 | 44.774 |
| 9.399999999999675 | 25.701 | 30.441 | 44.891 |
| 9.409999999999675 | 25.726 | 30.497 | 45.009 |
| 9.419999999999675 | 25.75 | 30.553 | 45.128 |
| 9.429999999999675 | 25.775 | 30.608 | 45.246 |
| 9.439999999999674 | 25.799 | 30.664 | 45.365 |
| 9.449999999999674 | 25.824 | 30.72 | 45.484 |
| 9.459999999999672 | 25.849 | 30.776 | 45.604 |
| 9.469999999999674 | 25.873 | 30.832 | 45.723 |
| 9.479999999999674 | 25.898 | 30.889 | 45.844 |
| 9.489999999999673 | 25.923 | 30.945 | 45.964 |
| 9.499999999999673 | 25.947 | 31.002 | 46.085 |
| 9.509999999999671 | 25.972 | 31.058 | 46.206 |
| 9.519999999999673 | 25.997 | 31.115 | 46.327 |
| 9.529999999999673 | 26.022 | 31.172 | 46.449 |
| 9.539999999999672 | 26.046 | 31.228 | 46.571 |
| 9.549999999999672 | 26.071 | 31.285 | 46.693 |
| 9.55999999999967 | 26.096 | 31.343 | 46.816 |
| 9.56999999999967 | 26.121 | 31.4 | 46.939 |
| 9.57999999999967 | 26.146 | 31.457 | 47.062 |
| 9.58999999999967 | 26.171 | 31.514 | 47.186 |
| 9.59999999999967 | 26.196 | 31.572 | 47.31 |
| 9.60999999999967 | 26.221 | 31.63 | 47.434 |
| 9.61999999999967 | 26.246 | 31.687 | 47.559 |
| 9.62999999999967 | 26.271 | 31.745 | 47.684 |
| 9.63999999999967 | 26.296 | 31.803 | 47.809 |
| 9.64999999999967 | 26.321 | 31.861 | 47.935 |
| 9.65999999999967 | 26.346 | 31.919 | 48.06 |
| 9.66999999999967 | 26.371 | 31.978 | 48.187 |
| 9.67999999999967 | 26.396 | 32.036 | 48.313 |
| 9.689999999999667 | 26.421 | 32.094 | 48.44 |
| 9.699999999999669 | 26.447 | 32.153 | 48.568 |
| 9.709999999999669 | 26.472 | 32.212 | 48.695 |
| 9.719999999999668 | 26.497 | 32.27 | 48.823 |
| 9.729999999999668 | 26.522 | 32.329 | 48.951 |
| 9.739999999999666 | 26.548 | 32.388 | 49.08 |
| 9.749999999999668 | 26.573 | 32.447 | 49.209 |
| 9.759999999999668 | 26.598 | 32.507 | 49.338 |
| 9.769999999999667 | 26.624 | 32.566 | 49.468 |
| 9.779999999999667 | 26.649 | 32.625 | 49.598 |
| 9.789999999999665 | 26.674 | 32.685 | 49.728 |
| 9.799999999999667 | 26.7 | 32.744 | 49.859 |
| 9.809999999999667 | 26.725 | 32.804 | 49.99 |
| 9.819999999999666 | 26.751 | 32.864 | 50.121 |
| 9.829999999999666 | 26.776 | 32.924 | 50.253 |
| 9.839999999999664 | 26.802 | 32.984 | 50.385 |
| 9.849999999999666 | 26.827 | 33.044 | 50.517 |
| 9.859999999999665 | 26.853 | 33.105 | 50.65 |
| 9.869999999999665 | 26.879 | 33.165 | 50.783 |
| 9.879999999999663 | 26.904 | 33.226 | 50.916 |
| 9.889999999999665 | 26.93 | 33.286 | 51.05 |
| 9.899999999999665 | 26.956 | 33.347 | 51.184 |
| 9.909999999999664 | 26.981 | 33.408 | 51.318 |
| 9.919999999999664 | 27.007 | 33.469 | 51.453 |
| 9.929999999999662 | 27.033 | 33.53 | 51.588 |
| 9.939999999999664 | 27.059 | 33.591 | 51.724 |
| 9.949999999999664 | 27.084 | 33.652 | 51.86 |
| 9.95999999999966 | 27.11 | 33.714 | 51.996 |
| 9.96999999999966 | 27.136 | 33.775 | 52.133 |
| 9.97999999999966 | 27.162 | 33.837 | 52.27 |
| 9.98999999999966 | 27.188 | 33.899 | 52.407 |
| 9.99999999999966 | 27.214 | 33.961 | 52.545 |